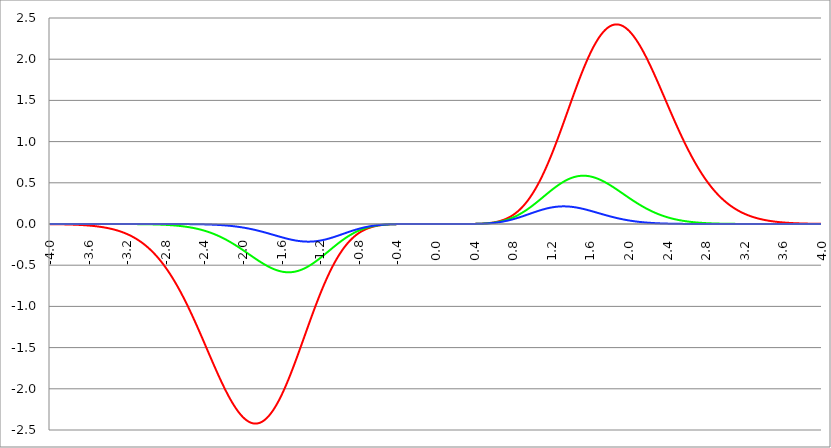
| Category | Series 1 | Series 0 | Series 2 |
|---|---|---|---|
| -4.0 | -0.002 | 0 | 0 |
| -3.996 | -0.002 | 0 | 0 |
| -3.992 | -0.002 | 0 | 0 |
| -3.988 | -0.002 | 0 | 0 |
| -3.984 | -0.002 | 0 | 0 |
| -3.98 | -0.002 | 0 | 0 |
| -3.976 | -0.002 | 0 | 0 |
| -3.972 | -0.002 | 0 | 0 |
| -3.968 | -0.002 | 0 | 0 |
| -3.964 | -0.002 | 0 | 0 |
| -3.96 | -0.002 | 0 | 0 |
| -3.956 | -0.002 | 0 | 0 |
| -3.952 | -0.002 | 0 | 0 |
| -3.948 | -0.003 | 0 | 0 |
| -3.944 | -0.003 | 0 | 0 |
| -3.94 | -0.003 | 0 | 0 |
| -3.936 | -0.003 | 0 | 0 |
| -3.932 | -0.003 | 0 | 0 |
| -3.928 | -0.003 | 0 | 0 |
| -3.924 | -0.003 | 0 | 0 |
| -3.92 | -0.003 | 0 | 0 |
| -3.916 | -0.003 | 0 | 0 |
| -3.912 | -0.003 | 0 | 0 |
| -3.908 | -0.003 | 0 | 0 |
| -3.904 | -0.003 | 0 | 0 |
| -3.9 | -0.003 | 0 | 0 |
| -3.896 | -0.003 | 0 | 0 |
| -3.892 | -0.004 | 0 | 0 |
| -3.888 | -0.004 | 0 | 0 |
| -3.884 | -0.004 | 0 | 0 |
| -3.88 | -0.004 | 0 | 0 |
| -3.876 | -0.004 | 0 | 0 |
| -3.872 | -0.004 | 0 | 0 |
| -3.868 | -0.004 | 0 | 0 |
| -3.864 | -0.004 | 0 | 0 |
| -3.86 | -0.004 | 0 | 0 |
| -3.856 | -0.004 | 0 | 0 |
| -3.852 | -0.005 | 0 | 0 |
| -3.848 | -0.005 | 0 | 0 |
| -3.844 | -0.005 | 0 | 0 |
| -3.84 | -0.005 | 0 | 0 |
| -3.836 | -0.005 | 0 | 0 |
| -3.832 | -0.005 | 0 | 0 |
| -3.828 | -0.005 | 0 | 0 |
| -3.824 | -0.005 | 0 | 0 |
| -3.82 | -0.005 | 0 | 0 |
| -3.816 | -0.006 | 0 | 0 |
| -3.812 | -0.006 | 0 | 0 |
| -3.808 | -0.006 | 0 | 0 |
| -3.804 | -0.006 | 0 | 0 |
| -3.8 | -0.006 | 0 | 0 |
| -3.796 | -0.006 | 0 | 0 |
| -3.792 | -0.006 | 0 | 0 |
| -3.788 | -0.007 | 0 | 0 |
| -3.784 | -0.007 | 0 | 0 |
| -3.78 | -0.007 | 0 | 0 |
| -3.776 | -0.007 | 0 | 0 |
| -3.772 | -0.007 | 0 | 0 |
| -3.768 | -0.007 | 0 | 0 |
| -3.764 | -0.008 | 0 | 0 |
| -3.76 | -0.008 | 0 | 0 |
| -3.756 | -0.008 | 0 | 0 |
| -3.752 | -0.008 | 0 | 0 |
| -3.748 | -0.008 | 0 | 0 |
| -3.744 | -0.008 | 0 | 0 |
| -3.74 | -0.009 | 0 | 0 |
| -3.736 | -0.009 | 0 | 0 |
| -3.732 | -0.009 | 0 | 0 |
| -3.728 | -0.009 | 0 | 0 |
| -3.724 | -0.009 | 0 | 0 |
| -3.72 | -0.01 | 0 | 0 |
| -3.716 | -0.01 | 0 | 0 |
| -3.712 | -0.01 | 0 | 0 |
| -3.708 | -0.01 | 0 | 0 |
| -3.704 | -0.011 | 0 | 0 |
| -3.7 | -0.011 | 0 | 0 |
| -3.696 | -0.011 | 0 | 0 |
| -3.692 | -0.011 | 0 | 0 |
| -3.688 | -0.011 | 0 | 0 |
| -3.684 | -0.012 | 0 | 0 |
| -3.68 | -0.012 | 0 | 0 |
| -3.676 | -0.012 | 0 | 0 |
| -3.672 | -0.013 | 0 | 0 |
| -3.668 | -0.013 | 0 | 0 |
| -3.664 | -0.013 | 0 | 0 |
| -3.66 | -0.013 | 0 | 0 |
| -3.656 | -0.014 | 0 | 0 |
| -3.652 | -0.014 | 0 | 0 |
| -3.648 | -0.014 | 0 | 0 |
| -3.644 | -0.015 | 0 | 0 |
| -3.64 | -0.015 | 0 | 0 |
| -3.636 | -0.015 | 0 | 0 |
| -3.632 | -0.016 | 0 | 0 |
| -3.628 | -0.016 | 0 | 0 |
| -3.624 | -0.016 | 0 | 0 |
| -3.62 | -0.017 | 0 | 0 |
| -3.616 | -0.017 | 0 | 0 |
| -3.612 | -0.017 | 0 | 0 |
| -3.608 | -0.018 | 0 | 0 |
| -3.604 | -0.018 | 0 | 0 |
| -3.6 | -0.018 | 0 | 0 |
| -3.596 | -0.019 | 0 | 0 |
| -3.592 | -0.019 | 0 | 0 |
| -3.588 | -0.02 | 0 | 0 |
| -3.584 | -0.02 | 0 | 0 |
| -3.58 | -0.02 | 0 | 0 |
| -3.576 | -0.021 | 0 | 0 |
| -3.572 | -0.021 | 0 | 0 |
| -3.568 | -0.022 | 0 | 0 |
| -3.564 | -0.022 | 0 | 0 |
| -3.56 | -0.023 | 0 | 0 |
| -3.556 | -0.023 | 0 | 0 |
| -3.552 | -0.024 | 0 | 0 |
| -3.548 | -0.024 | 0 | 0 |
| -3.544 | -0.025 | 0 | 0 |
| -3.54 | -0.025 | 0 | 0 |
| -3.536 | -0.026 | 0 | 0 |
| -3.532 | -0.026 | 0 | 0 |
| -3.528 | -0.027 | 0 | 0 |
| -3.524 | -0.027 | 0 | 0 |
| -3.52 | -0.028 | 0 | 0 |
| -3.516 | -0.028 | 0 | 0 |
| -3.512 | -0.029 | 0 | 0 |
| -3.508 | -0.03 | 0 | 0 |
| -3.504 | -0.03 | 0 | 0 |
| -3.5 | -0.031 | 0 | 0 |
| -3.496 | -0.031 | 0 | 0 |
| -3.492 | -0.032 | 0 | 0 |
| -3.488 | -0.033 | 0 | 0 |
| -3.484 | -0.033 | 0 | 0 |
| -3.48 | -0.034 | 0 | 0 |
| -3.476 | -0.035 | 0 | 0 |
| -3.472 | -0.035 | 0 | 0 |
| -3.467999999999999 | -0.036 | 0 | 0 |
| -3.463999999999999 | -0.037 | 0 | 0 |
| -3.459999999999999 | -0.038 | 0 | 0 |
| -3.455999999999999 | -0.038 | 0 | 0 |
| -3.451999999999999 | -0.039 | 0 | 0 |
| -3.447999999999999 | -0.04 | 0 | 0 |
| -3.443999999999999 | -0.041 | 0 | 0 |
| -3.439999999999999 | -0.041 | 0 | 0 |
| -3.435999999999999 | -0.042 | 0 | 0 |
| -3.431999999999999 | -0.043 | 0 | 0 |
| -3.427999999999999 | -0.044 | 0 | 0 |
| -3.423999999999999 | -0.045 | 0 | 0 |
| -3.419999999999999 | -0.046 | 0 | 0 |
| -3.415999999999999 | -0.046 | 0 | 0 |
| -3.411999999999999 | -0.047 | 0 | 0 |
| -3.407999999999999 | -0.048 | 0 | 0 |
| -3.403999999999999 | -0.049 | 0 | 0 |
| -3.399999999999999 | -0.05 | 0 | 0 |
| -3.395999999999999 | -0.051 | 0 | 0 |
| -3.391999999999999 | -0.052 | 0 | 0 |
| -3.387999999999999 | -0.053 | 0 | 0 |
| -3.383999999999999 | -0.054 | 0 | 0 |
| -3.379999999999999 | -0.055 | 0 | 0 |
| -3.375999999999999 | -0.056 | 0 | 0 |
| -3.371999999999999 | -0.057 | 0 | 0 |
| -3.367999999999999 | -0.058 | 0 | 0 |
| -3.363999999999999 | -0.059 | 0 | 0 |
| -3.359999999999999 | -0.06 | 0 | 0 |
| -3.355999999999999 | -0.062 | 0 | 0 |
| -3.351999999999999 | -0.063 | 0 | 0 |
| -3.347999999999999 | -0.064 | 0 | 0 |
| -3.343999999999999 | -0.065 | 0 | 0 |
| -3.339999999999999 | -0.066 | 0 | 0 |
| -3.335999999999999 | -0.068 | 0 | 0 |
| -3.331999999999999 | -0.069 | 0 | 0 |
| -3.327999999999999 | -0.07 | 0 | 0 |
| -3.323999999999999 | -0.071 | 0 | 0 |
| -3.319999999999999 | -0.073 | 0 | 0 |
| -3.315999999999999 | -0.074 | 0 | 0 |
| -3.311999999999999 | -0.075 | 0 | 0 |
| -3.307999999999999 | -0.077 | 0 | 0 |
| -3.303999999999999 | -0.078 | 0 | 0 |
| -3.299999999999999 | -0.079 | 0 | 0 |
| -3.295999999999999 | -0.081 | 0 | 0 |
| -3.291999999999999 | -0.082 | 0 | 0 |
| -3.288 | -0.084 | 0 | 0 |
| -3.284 | -0.085 | 0 | 0 |
| -3.279999999999999 | -0.087 | 0 | 0 |
| -3.275999999999999 | -0.088 | 0 | 0 |
| -3.271999999999999 | -0.09 | 0 | 0 |
| -3.268 | -0.092 | 0 | 0 |
| -3.264 | -0.093 | 0 | 0 |
| -3.259999999999999 | -0.095 | 0 | 0 |
| -3.255999999999999 | -0.097 | 0 | 0 |
| -3.251999999999999 | -0.098 | 0 | 0 |
| -3.248 | -0.1 | -0.001 | 0 |
| -3.244 | -0.102 | -0.001 | 0 |
| -3.239999999999999 | -0.103 | -0.001 | 0 |
| -3.235999999999999 | -0.105 | -0.001 | 0 |
| -3.231999999999999 | -0.107 | -0.001 | 0 |
| -3.228 | -0.109 | -0.001 | 0 |
| -3.224 | -0.111 | -0.001 | 0 |
| -3.219999999999999 | -0.113 | -0.001 | 0 |
| -3.215999999999999 | -0.115 | -0.001 | 0 |
| -3.211999999999999 | -0.117 | -0.001 | 0 |
| -3.208 | -0.119 | -0.001 | 0 |
| -3.204 | -0.121 | -0.001 | 0 |
| -3.199999999999999 | -0.123 | -0.001 | 0 |
| -3.195999999999999 | -0.125 | -0.001 | 0 |
| -3.191999999999999 | -0.127 | -0.001 | 0 |
| -3.188 | -0.129 | -0.001 | 0 |
| -3.184 | -0.131 | -0.001 | 0 |
| -3.179999999999999 | -0.133 | -0.001 | 0 |
| -3.175999999999999 | -0.136 | -0.001 | 0 |
| -3.171999999999999 | -0.138 | -0.001 | 0 |
| -3.168 | -0.14 | -0.001 | 0 |
| -3.164 | -0.143 | -0.001 | 0 |
| -3.159999999999999 | -0.145 | -0.001 | 0 |
| -3.155999999999999 | -0.147 | -0.001 | 0 |
| -3.151999999999999 | -0.15 | -0.001 | 0 |
| -3.148 | -0.152 | -0.001 | 0 |
| -3.144 | -0.155 | -0.001 | 0 |
| -3.139999999999999 | -0.157 | -0.001 | 0 |
| -3.135999999999999 | -0.16 | -0.001 | 0 |
| -3.131999999999999 | -0.162 | -0.001 | 0 |
| -3.128 | -0.165 | -0.001 | 0 |
| -3.124 | -0.168 | -0.001 | 0 |
| -3.119999999999999 | -0.17 | -0.001 | 0 |
| -3.115999999999999 | -0.173 | -0.001 | 0 |
| -3.111999999999999 | -0.176 | -0.001 | 0 |
| -3.108 | -0.179 | -0.001 | 0 |
| -3.104 | -0.182 | -0.001 | 0 |
| -3.099999999999999 | -0.184 | -0.002 | 0 |
| -3.095999999999999 | -0.187 | -0.002 | 0 |
| -3.091999999999999 | -0.19 | -0.002 | 0 |
| -3.088 | -0.193 | -0.002 | 0 |
| -3.084 | -0.196 | -0.002 | 0 |
| -3.079999999999999 | -0.2 | -0.002 | 0 |
| -3.075999999999999 | -0.203 | -0.002 | 0 |
| -3.071999999999999 | -0.206 | -0.002 | 0 |
| -3.068 | -0.209 | -0.002 | 0 |
| -3.064 | -0.212 | -0.002 | 0 |
| -3.059999999999999 | -0.216 | -0.002 | 0 |
| -3.055999999999999 | -0.219 | -0.002 | 0 |
| -3.051999999999999 | -0.222 | -0.002 | 0 |
| -3.048 | -0.226 | -0.002 | 0 |
| -3.044 | -0.229 | -0.002 | 0 |
| -3.039999999999999 | -0.233 | -0.002 | 0 |
| -3.035999999999999 | -0.236 | -0.002 | 0 |
| -3.031999999999999 | -0.24 | -0.002 | 0 |
| -3.028 | -0.243 | -0.002 | 0 |
| -3.024 | -0.247 | -0.003 | 0 |
| -3.019999999999999 | -0.251 | -0.003 | 0 |
| -3.015999999999999 | -0.254 | -0.003 | 0 |
| -3.011999999999999 | -0.258 | -0.003 | 0 |
| -3.008 | -0.262 | -0.003 | 0 |
| -3.004 | -0.266 | -0.003 | 0 |
| -2.999999999999999 | -0.27 | -0.003 | 0 |
| -2.995999999999999 | -0.274 | -0.003 | 0 |
| -2.991999999999999 | -0.278 | -0.003 | 0 |
| -2.988 | -0.282 | -0.003 | 0 |
| -2.984 | -0.286 | -0.003 | 0 |
| -2.979999999999999 | -0.29 | -0.003 | 0 |
| -2.975999999999999 | -0.294 | -0.004 | 0 |
| -2.971999999999999 | -0.299 | -0.004 | 0 |
| -2.968 | -0.303 | -0.004 | 0 |
| -2.964 | -0.307 | -0.004 | 0 |
| -2.959999999999999 | -0.312 | -0.004 | 0 |
| -2.955999999999999 | -0.316 | -0.004 | 0 |
| -2.951999999999999 | -0.321 | -0.004 | 0 |
| -2.948 | -0.325 | -0.004 | 0 |
| -2.944 | -0.33 | -0.004 | 0 |
| -2.939999999999999 | -0.335 | -0.004 | 0 |
| -2.935999999999999 | -0.339 | -0.005 | 0 |
| -2.931999999999999 | -0.344 | -0.005 | 0 |
| -2.928 | -0.349 | -0.005 | 0 |
| -2.924 | -0.354 | -0.005 | 0 |
| -2.919999999999999 | -0.359 | -0.005 | 0 |
| -2.915999999999999 | -0.364 | -0.005 | 0 |
| -2.911999999999999 | -0.369 | -0.005 | 0 |
| -2.908 | -0.374 | -0.005 | 0 |
| -2.904 | -0.379 | -0.006 | 0 |
| -2.899999999999999 | -0.384 | -0.006 | 0 |
| -2.895999999999999 | -0.389 | -0.006 | 0 |
| -2.891999999999999 | -0.395 | -0.006 | 0 |
| -2.887999999999999 | -0.4 | -0.006 | 0 |
| -2.883999999999999 | -0.405 | -0.006 | 0 |
| -2.879999999999999 | -0.411 | -0.006 | 0 |
| -2.875999999999999 | -0.416 | -0.007 | 0 |
| -2.871999999999999 | -0.422 | -0.007 | 0 |
| -2.867999999999999 | -0.427 | -0.007 | 0 |
| -2.863999999999999 | -0.433 | -0.007 | 0 |
| -2.859999999999999 | -0.439 | -0.007 | 0 |
| -2.855999999999999 | -0.445 | -0.008 | 0 |
| -2.851999999999999 | -0.45 | -0.008 | 0 |
| -2.847999999999999 | -0.456 | -0.008 | 0 |
| -2.843999999999999 | -0.462 | -0.008 | 0 |
| -2.839999999999999 | -0.468 | -0.008 | 0 |
| -2.835999999999999 | -0.474 | -0.009 | 0 |
| -2.831999999999999 | -0.48 | -0.009 | 0 |
| -2.827999999999999 | -0.486 | -0.009 | 0 |
| -2.823999999999999 | -0.493 | -0.009 | 0 |
| -2.819999999999999 | -0.499 | -0.009 | 0 |
| -2.815999999999999 | -0.505 | -0.01 | 0 |
| -2.811999999999999 | -0.512 | -0.01 | 0 |
| -2.807999999999999 | -0.518 | -0.01 | 0 |
| -2.803999999999999 | -0.525 | -0.01 | 0 |
| -2.799999999999999 | -0.531 | -0.011 | 0 |
| -2.795999999999999 | -0.538 | -0.011 | 0 |
| -2.791999999999999 | -0.544 | -0.011 | 0 |
| -2.787999999999999 | -0.551 | -0.011 | 0 |
| -2.783999999999999 | -0.558 | -0.012 | 0 |
| -2.779999999999999 | -0.565 | -0.012 | 0 |
| -2.775999999999999 | -0.572 | -0.012 | 0 |
| -2.771999999999999 | -0.579 | -0.012 | 0 |
| -2.767999999999999 | -0.586 | -0.013 | 0 |
| -2.763999999999999 | -0.593 | -0.013 | 0 |
| -2.759999999999999 | -0.6 | -0.013 | 0 |
| -2.755999999999999 | -0.607 | -0.014 | 0 |
| -2.751999999999999 | -0.614 | -0.014 | 0 |
| -2.747999999999999 | -0.622 | -0.014 | 0 |
| -2.743999999999999 | -0.629 | -0.015 | 0 |
| -2.739999999999999 | -0.636 | -0.015 | 0 |
| -2.735999999999999 | -0.644 | -0.015 | 0 |
| -2.731999999999999 | -0.651 | -0.016 | 0 |
| -2.727999999999999 | -0.659 | -0.016 | 0 |
| -2.723999999999999 | -0.667 | -0.016 | 0 |
| -2.719999999999999 | -0.674 | -0.017 | 0 |
| -2.715999999999999 | -0.682 | -0.017 | 0 |
| -2.711999999999999 | -0.69 | -0.017 | 0 |
| -2.707999999999999 | -0.698 | -0.018 | 0 |
| -2.703999999999999 | -0.706 | -0.018 | 0 |
| -2.699999999999999 | -0.714 | -0.019 | 0 |
| -2.695999999999999 | -0.722 | -0.019 | -0.001 |
| -2.691999999999999 | -0.73 | -0.019 | -0.001 |
| -2.687999999999999 | -0.738 | -0.02 | -0.001 |
| -2.683999999999999 | -0.746 | -0.02 | -0.001 |
| -2.679999999999999 | -0.755 | -0.021 | -0.001 |
| -2.675999999999999 | -0.763 | -0.021 | -0.001 |
| -2.671999999999999 | -0.771 | -0.022 | -0.001 |
| -2.667999999999999 | -0.78 | -0.022 | -0.001 |
| -2.663999999999999 | -0.788 | -0.023 | -0.001 |
| -2.659999999999999 | -0.797 | -0.023 | -0.001 |
| -2.655999999999999 | -0.805 | -0.024 | -0.001 |
| -2.651999999999999 | -0.814 | -0.024 | -0.001 |
| -2.647999999999999 | -0.823 | -0.025 | -0.001 |
| -2.643999999999999 | -0.831 | -0.025 | -0.001 |
| -2.639999999999999 | -0.84 | -0.026 | -0.001 |
| -2.635999999999999 | -0.849 | -0.026 | -0.001 |
| -2.631999999999999 | -0.858 | -0.027 | -0.001 |
| -2.627999999999999 | -0.867 | -0.027 | -0.001 |
| -2.623999999999999 | -0.876 | -0.028 | -0.001 |
| -2.619999999999999 | -0.885 | -0.029 | -0.001 |
| -2.615999999999999 | -0.894 | -0.029 | -0.001 |
| -2.611999999999999 | -0.903 | -0.03 | -0.001 |
| -2.607999999999999 | -0.912 | -0.03 | -0.001 |
| -2.603999999999999 | -0.922 | -0.031 | -0.001 |
| -2.599999999999999 | -0.931 | -0.032 | -0.001 |
| -2.595999999999999 | -0.94 | -0.032 | -0.001 |
| -2.591999999999999 | -0.95 | -0.033 | -0.001 |
| -2.587999999999999 | -0.959 | -0.034 | -0.001 |
| -2.583999999999999 | -0.969 | -0.034 | -0.001 |
| -2.579999999999999 | -0.978 | -0.035 | -0.001 |
| -2.575999999999999 | -0.988 | -0.036 | -0.001 |
| -2.571999999999999 | -0.998 | -0.037 | -0.001 |
| -2.567999999999999 | -1.007 | -0.037 | -0.001 |
| -2.563999999999999 | -1.017 | -0.038 | -0.001 |
| -2.559999999999999 | -1.027 | -0.039 | -0.001 |
| -2.555999999999999 | -1.037 | -0.04 | -0.002 |
| -2.551999999999999 | -1.046 | -0.04 | -0.002 |
| -2.547999999999999 | -1.056 | -0.041 | -0.002 |
| -2.543999999999999 | -1.066 | -0.042 | -0.002 |
| -2.539999999999999 | -1.076 | -0.043 | -0.002 |
| -2.535999999999999 | -1.086 | -0.044 | -0.002 |
| -2.531999999999999 | -1.096 | -0.044 | -0.002 |
| -2.527999999999999 | -1.107 | -0.045 | -0.002 |
| -2.523999999999999 | -1.117 | -0.046 | -0.002 |
| -2.519999999999999 | -1.127 | -0.047 | -0.002 |
| -2.515999999999999 | -1.137 | -0.048 | -0.002 |
| -2.511999999999999 | -1.147 | -0.049 | -0.002 |
| -2.507999999999999 | -1.158 | -0.05 | -0.002 |
| -2.503999999999999 | -1.168 | -0.051 | -0.002 |
| -2.499999999999999 | -1.178 | -0.052 | -0.002 |
| -2.495999999999999 | -1.189 | -0.053 | -0.002 |
| -2.491999999999999 | -1.199 | -0.054 | -0.002 |
| -2.487999999999999 | -1.21 | -0.055 | -0.002 |
| -2.483999999999999 | -1.22 | -0.056 | -0.003 |
| -2.479999999999999 | -1.23 | -0.057 | -0.003 |
| -2.475999999999999 | -1.241 | -0.058 | -0.003 |
| -2.471999999999999 | -1.252 | -0.059 | -0.003 |
| -2.467999999999999 | -1.262 | -0.06 | -0.003 |
| -2.463999999999999 | -1.273 | -0.061 | -0.003 |
| -2.459999999999999 | -1.283 | -0.062 | -0.003 |
| -2.455999999999999 | -1.294 | -0.063 | -0.003 |
| -2.451999999999999 | -1.305 | -0.065 | -0.003 |
| -2.447999999999999 | -1.315 | -0.066 | -0.003 |
| -2.443999999999999 | -1.326 | -0.067 | -0.003 |
| -2.439999999999999 | -1.337 | -0.068 | -0.003 |
| -2.435999999999999 | -1.348 | -0.069 | -0.004 |
| -2.431999999999999 | -1.358 | -0.071 | -0.004 |
| -2.427999999999999 | -1.369 | -0.072 | -0.004 |
| -2.423999999999999 | -1.38 | -0.073 | -0.004 |
| -2.419999999999999 | -1.391 | -0.074 | -0.004 |
| -2.415999999999999 | -1.402 | -0.076 | -0.004 |
| -2.411999999999999 | -1.413 | -0.077 | -0.004 |
| -2.407999999999999 | -1.423 | -0.078 | -0.004 |
| -2.403999999999999 | -1.434 | -0.08 | -0.004 |
| -2.399999999999999 | -1.445 | -0.081 | -0.005 |
| -2.395999999999999 | -1.456 | -0.083 | -0.005 |
| -2.391999999999999 | -1.467 | -0.084 | -0.005 |
| -2.387999999999999 | -1.478 | -0.085 | -0.005 |
| -2.383999999999999 | -1.489 | -0.087 | -0.005 |
| -2.379999999999999 | -1.5 | -0.088 | -0.005 |
| -2.375999999999999 | -1.511 | -0.09 | -0.005 |
| -2.371999999999999 | -1.522 | -0.091 | -0.005 |
| -2.367999999999998 | -1.532 | -0.093 | -0.006 |
| -2.363999999999998 | -1.543 | -0.094 | -0.006 |
| -2.359999999999998 | -1.554 | -0.096 | -0.006 |
| -2.355999999999998 | -1.565 | -0.098 | -0.006 |
| -2.351999999999998 | -1.576 | -0.099 | -0.006 |
| -2.347999999999998 | -1.587 | -0.101 | -0.006 |
| -2.343999999999998 | -1.598 | -0.102 | -0.007 |
| -2.339999999999998 | -1.609 | -0.104 | -0.007 |
| -2.335999999999998 | -1.62 | -0.106 | -0.007 |
| -2.331999999999998 | -1.63 | -0.108 | -0.007 |
| -2.327999999999998 | -1.641 | -0.109 | -0.007 |
| -2.323999999999998 | -1.652 | -0.111 | -0.007 |
| -2.319999999999998 | -1.663 | -0.113 | -0.008 |
| -2.315999999999998 | -1.674 | -0.115 | -0.008 |
| -2.311999999999998 | -1.684 | -0.116 | -0.008 |
| -2.307999999999998 | -1.695 | -0.118 | -0.008 |
| -2.303999999999998 | -1.706 | -0.12 | -0.008 |
| -2.299999999999998 | -1.717 | -0.122 | -0.009 |
| -2.295999999999998 | -1.727 | -0.124 | -0.009 |
| -2.291999999999998 | -1.738 | -0.126 | -0.009 |
| -2.287999999999998 | -1.749 | -0.128 | -0.009 |
| -2.283999999999998 | -1.759 | -0.13 | -0.01 |
| -2.279999999999998 | -1.77 | -0.132 | -0.01 |
| -2.275999999999998 | -1.78 | -0.134 | -0.01 |
| -2.271999999999998 | -1.791 | -0.136 | -0.01 |
| -2.267999999999998 | -1.801 | -0.138 | -0.011 |
| -2.263999999999998 | -1.812 | -0.14 | -0.011 |
| -2.259999999999998 | -1.822 | -0.142 | -0.011 |
| -2.255999999999998 | -1.832 | -0.144 | -0.011 |
| -2.251999999999998 | -1.843 | -0.146 | -0.012 |
| -2.247999999999998 | -1.853 | -0.148 | -0.012 |
| -2.243999999999998 | -1.863 | -0.15 | -0.012 |
| -2.239999999999998 | -1.873 | -0.152 | -0.012 |
| -2.235999999999998 | -1.883 | -0.155 | -0.013 |
| -2.231999999999998 | -1.894 | -0.157 | -0.013 |
| -2.227999999999998 | -1.904 | -0.159 | -0.013 |
| -2.223999999999998 | -1.914 | -0.161 | -0.014 |
| -2.219999999999998 | -1.924 | -0.164 | -0.014 |
| -2.215999999999998 | -1.933 | -0.166 | -0.014 |
| -2.211999999999998 | -1.943 | -0.168 | -0.015 |
| -2.207999999999998 | -1.953 | -0.171 | -0.015 |
| -2.203999999999998 | -1.963 | -0.173 | -0.015 |
| -2.199999999999998 | -1.972 | -0.175 | -0.016 |
| -2.195999999999998 | -1.982 | -0.178 | -0.016 |
| -2.191999999999998 | -1.991 | -0.18 | -0.016 |
| -2.187999999999998 | -2.001 | -0.183 | -0.017 |
| -2.183999999999998 | -2.01 | -0.185 | -0.017 |
| -2.179999999999998 | -2.02 | -0.188 | -0.017 |
| -2.175999999999998 | -2.029 | -0.19 | -0.018 |
| -2.171999999999998 | -2.038 | -0.193 | -0.018 |
| -2.167999999999998 | -2.047 | -0.195 | -0.019 |
| -2.163999999999998 | -2.056 | -0.198 | -0.019 |
| -2.159999999999998 | -2.065 | -0.2 | -0.019 |
| -2.155999999999998 | -2.074 | -0.203 | -0.02 |
| -2.151999999999998 | -2.083 | -0.206 | -0.02 |
| -2.147999999999998 | -2.091 | -0.208 | -0.021 |
| -2.143999999999998 | -2.1 | -0.211 | -0.021 |
| -2.139999999999998 | -2.109 | -0.214 | -0.022 |
| -2.135999999999998 | -2.117 | -0.216 | -0.022 |
| -2.131999999999998 | -2.125 | -0.219 | -0.023 |
| -2.127999999999998 | -2.134 | -0.222 | -0.023 |
| -2.123999999999998 | -2.142 | -0.224 | -0.024 |
| -2.119999999999998 | -2.15 | -0.227 | -0.024 |
| -2.115999999999998 | -2.158 | -0.23 | -0.025 |
| -2.111999999999998 | -2.166 | -0.233 | -0.025 |
| -2.107999999999998 | -2.174 | -0.236 | -0.026 |
| -2.103999999999998 | -2.182 | -0.239 | -0.026 |
| -2.099999999999998 | -2.189 | -0.241 | -0.027 |
| -2.095999999999998 | -2.197 | -0.244 | -0.027 |
| -2.091999999999998 | -2.204 | -0.247 | -0.028 |
| -2.087999999999998 | -2.212 | -0.25 | -0.028 |
| -2.083999999999998 | -2.219 | -0.253 | -0.029 |
| -2.079999999999998 | -2.226 | -0.256 | -0.029 |
| -2.075999999999998 | -2.233 | -0.259 | -0.03 |
| -2.071999999999998 | -2.24 | -0.262 | -0.031 |
| -2.067999999999998 | -2.247 | -0.265 | -0.031 |
| -2.063999999999998 | -2.253 | -0.268 | -0.032 |
| -2.059999999999998 | -2.26 | -0.271 | -0.032 |
| -2.055999999999998 | -2.266 | -0.274 | -0.033 |
| -2.051999999999998 | -2.273 | -0.277 | -0.034 |
| -2.047999999999998 | -2.279 | -0.28 | -0.034 |
| -2.043999999999998 | -2.285 | -0.283 | -0.035 |
| -2.039999999999998 | -2.291 | -0.286 | -0.036 |
| -2.035999999999998 | -2.297 | -0.289 | -0.036 |
| -2.031999999999998 | -2.303 | -0.292 | -0.037 |
| -2.027999999999998 | -2.308 | -0.295 | -0.038 |
| -2.023999999999998 | -2.314 | -0.298 | -0.038 |
| -2.019999999999998 | -2.319 | -0.302 | -0.039 |
| -2.015999999999998 | -2.325 | -0.305 | -0.04 |
| -2.011999999999998 | -2.33 | -0.308 | -0.041 |
| -2.007999999999998 | -2.335 | -0.311 | -0.041 |
| -2.003999999999998 | -2.34 | -0.314 | -0.042 |
| -1.999999999999998 | -2.344 | -0.317 | -0.043 |
| -1.995999999999998 | -2.349 | -0.32 | -0.044 |
| -1.991999999999998 | -2.354 | -0.324 | -0.045 |
| -1.987999999999998 | -2.358 | -0.327 | -0.045 |
| -1.983999999999998 | -2.362 | -0.33 | -0.046 |
| -1.979999999999998 | -2.366 | -0.333 | -0.047 |
| -1.975999999999998 | -2.37 | -0.336 | -0.048 |
| -1.971999999999998 | -2.374 | -0.34 | -0.049 |
| -1.967999999999998 | -2.378 | -0.343 | -0.049 |
| -1.963999999999998 | -2.381 | -0.346 | -0.05 |
| -1.959999999999998 | -2.385 | -0.349 | -0.051 |
| -1.955999999999998 | -2.388 | -0.353 | -0.052 |
| -1.951999999999998 | -2.391 | -0.356 | -0.053 |
| -1.947999999999998 | -2.394 | -0.359 | -0.054 |
| -1.943999999999998 | -2.397 | -0.362 | -0.055 |
| -1.939999999999998 | -2.399 | -0.365 | -0.056 |
| -1.935999999999998 | -2.402 | -0.369 | -0.057 |
| -1.931999999999998 | -2.404 | -0.372 | -0.058 |
| -1.927999999999998 | -2.407 | -0.375 | -0.058 |
| -1.923999999999998 | -2.409 | -0.378 | -0.059 |
| -1.919999999999998 | -2.411 | -0.382 | -0.06 |
| -1.915999999999998 | -2.412 | -0.385 | -0.061 |
| -1.911999999999998 | -2.414 | -0.388 | -0.062 |
| -1.907999999999998 | -2.416 | -0.391 | -0.063 |
| -1.903999999999998 | -2.417 | -0.395 | -0.064 |
| -1.899999999999998 | -2.418 | -0.398 | -0.065 |
| -1.895999999999998 | -2.419 | -0.401 | -0.066 |
| -1.891999999999998 | -2.42 | -0.404 | -0.067 |
| -1.887999999999998 | -2.421 | -0.407 | -0.069 |
| -1.883999999999998 | -2.421 | -0.41 | -0.07 |
| -1.879999999999998 | -2.422 | -0.414 | -0.071 |
| -1.875999999999998 | -2.422 | -0.417 | -0.072 |
| -1.871999999999998 | -2.422 | -0.42 | -0.073 |
| -1.867999999999998 | -2.422 | -0.423 | -0.074 |
| -1.863999999999998 | -2.422 | -0.426 | -0.075 |
| -1.859999999999998 | -2.422 | -0.429 | -0.076 |
| -1.855999999999998 | -2.421 | -0.433 | -0.077 |
| -1.851999999999998 | -2.42 | -0.436 | -0.078 |
| -1.847999999999998 | -2.42 | -0.439 | -0.08 |
| -1.843999999999998 | -2.419 | -0.442 | -0.081 |
| -1.839999999999998 | -2.418 | -0.445 | -0.082 |
| -1.835999999999998 | -2.416 | -0.448 | -0.083 |
| -1.831999999999998 | -2.415 | -0.451 | -0.084 |
| -1.827999999999998 | -2.413 | -0.454 | -0.085 |
| -1.823999999999998 | -2.411 | -0.457 | -0.087 |
| -1.819999999999998 | -2.41 | -0.46 | -0.088 |
| -1.815999999999998 | -2.408 | -0.463 | -0.089 |
| -1.811999999999998 | -2.405 | -0.466 | -0.09 |
| -1.807999999999998 | -2.403 | -0.469 | -0.091 |
| -1.803999999999998 | -2.4 | -0.472 | -0.093 |
| -1.799999999999998 | -2.398 | -0.475 | -0.094 |
| -1.795999999999998 | -2.395 | -0.477 | -0.095 |
| -1.791999999999998 | -2.392 | -0.48 | -0.096 |
| -1.787999999999998 | -2.389 | -0.483 | -0.098 |
| -1.783999999999998 | -2.385 | -0.486 | -0.099 |
| -1.779999999999998 | -2.382 | -0.489 | -0.1 |
| -1.775999999999998 | -2.378 | -0.491 | -0.101 |
| -1.771999999999998 | -2.374 | -0.494 | -0.103 |
| -1.767999999999998 | -2.371 | -0.497 | -0.104 |
| -1.763999999999998 | -2.366 | -0.499 | -0.105 |
| -1.759999999999998 | -2.362 | -0.502 | -0.107 |
| -1.755999999999998 | -2.358 | -0.505 | -0.108 |
| -1.751999999999998 | -2.353 | -0.507 | -0.109 |
| -1.747999999999998 | -2.349 | -0.51 | -0.111 |
| -1.743999999999998 | -2.344 | -0.512 | -0.112 |
| -1.739999999999998 | -2.339 | -0.515 | -0.113 |
| -1.735999999999998 | -2.334 | -0.517 | -0.115 |
| -1.731999999999998 | -2.328 | -0.52 | -0.116 |
| -1.727999999999998 | -2.323 | -0.522 | -0.117 |
| -1.723999999999998 | -2.317 | -0.524 | -0.119 |
| -1.719999999999998 | -2.311 | -0.527 | -0.12 |
| -1.715999999999998 | -2.306 | -0.529 | -0.121 |
| -1.711999999999998 | -2.3 | -0.531 | -0.123 |
| -1.707999999999998 | -2.293 | -0.533 | -0.124 |
| -1.703999999999998 | -2.287 | -0.535 | -0.125 |
| -1.699999999999998 | -2.281 | -0.538 | -0.127 |
| -1.695999999999998 | -2.274 | -0.54 | -0.128 |
| -1.691999999999998 | -2.267 | -0.542 | -0.129 |
| -1.687999999999998 | -2.26 | -0.544 | -0.131 |
| -1.683999999999998 | -2.253 | -0.546 | -0.132 |
| -1.679999999999998 | -2.246 | -0.548 | -0.134 |
| -1.675999999999998 | -2.239 | -0.55 | -0.135 |
| -1.671999999999998 | -2.231 | -0.551 | -0.136 |
| -1.667999999999998 | -2.224 | -0.553 | -0.138 |
| -1.663999999999998 | -2.216 | -0.555 | -0.139 |
| -1.659999999999998 | -2.208 | -0.557 | -0.14 |
| -1.655999999999998 | -2.2 | -0.558 | -0.142 |
| -1.651999999999998 | -2.192 | -0.56 | -0.143 |
| -1.647999999999998 | -2.184 | -0.562 | -0.144 |
| -1.643999999999998 | -2.175 | -0.563 | -0.146 |
| -1.639999999999998 | -2.167 | -0.565 | -0.147 |
| -1.635999999999998 | -2.158 | -0.566 | -0.148 |
| -1.631999999999998 | -2.149 | -0.568 | -0.15 |
| -1.627999999999998 | -2.141 | -0.569 | -0.151 |
| -1.623999999999998 | -2.132 | -0.57 | -0.153 |
| -1.619999999999998 | -2.122 | -0.571 | -0.154 |
| -1.615999999999998 | -2.113 | -0.573 | -0.155 |
| -1.611999999999998 | -2.104 | -0.574 | -0.156 |
| -1.607999999999998 | -2.094 | -0.575 | -0.158 |
| -1.603999999999998 | -2.085 | -0.576 | -0.159 |
| -1.599999999999998 | -2.075 | -0.577 | -0.16 |
| -1.595999999999998 | -2.065 | -0.578 | -0.162 |
| -1.591999999999998 | -2.055 | -0.579 | -0.163 |
| -1.587999999999998 | -2.045 | -0.58 | -0.164 |
| -1.583999999999998 | -2.035 | -0.58 | -0.166 |
| -1.579999999999998 | -2.025 | -0.581 | -0.167 |
| -1.575999999999998 | -2.015 | -0.582 | -0.168 |
| -1.571999999999998 | -2.004 | -0.583 | -0.169 |
| -1.567999999999998 | -1.994 | -0.583 | -0.171 |
| -1.563999999999998 | -1.983 | -0.584 | -0.172 |
| -1.559999999999998 | -1.972 | -0.584 | -0.173 |
| -1.555999999999998 | -1.961 | -0.585 | -0.174 |
| -1.551999999999998 | -1.951 | -0.585 | -0.175 |
| -1.547999999999998 | -1.94 | -0.585 | -0.177 |
| -1.543999999999998 | -1.928 | -0.586 | -0.178 |
| -1.539999999999998 | -1.917 | -0.586 | -0.179 |
| -1.535999999999998 | -1.906 | -0.586 | -0.18 |
| -1.531999999999998 | -1.895 | -0.586 | -0.181 |
| -1.527999999999998 | -1.883 | -0.586 | -0.182 |
| -1.523999999999998 | -1.872 | -0.586 | -0.183 |
| -1.519999999999998 | -1.86 | -0.586 | -0.185 |
| -1.515999999999998 | -1.848 | -0.586 | -0.186 |
| -1.511999999999998 | -1.837 | -0.586 | -0.187 |
| -1.507999999999998 | -1.825 | -0.585 | -0.188 |
| -1.503999999999998 | -1.813 | -0.585 | -0.189 |
| -1.499999999999998 | -1.801 | -0.585 | -0.19 |
| -1.495999999999998 | -1.789 | -0.584 | -0.191 |
| -1.491999999999998 | -1.777 | -0.584 | -0.192 |
| -1.487999999999998 | -1.765 | -0.583 | -0.193 |
| -1.483999999999998 | -1.752 | -0.583 | -0.194 |
| -1.479999999999998 | -1.74 | -0.582 | -0.195 |
| -1.475999999999998 | -1.728 | -0.581 | -0.196 |
| -1.471999999999998 | -1.715 | -0.581 | -0.196 |
| -1.467999999999998 | -1.703 | -0.58 | -0.197 |
| -1.463999999999998 | -1.69 | -0.579 | -0.198 |
| -1.459999999999998 | -1.678 | -0.578 | -0.199 |
| -1.455999999999998 | -1.665 | -0.577 | -0.2 |
| -1.451999999999998 | -1.653 | -0.576 | -0.201 |
| -1.447999999999998 | -1.64 | -0.575 | -0.201 |
| -1.443999999999998 | -1.627 | -0.574 | -0.202 |
| -1.439999999999998 | -1.614 | -0.572 | -0.203 |
| -1.435999999999998 | -1.601 | -0.571 | -0.204 |
| -1.431999999999998 | -1.589 | -0.57 | -0.204 |
| -1.427999999999998 | -1.576 | -0.568 | -0.205 |
| -1.423999999999998 | -1.563 | -0.567 | -0.206 |
| -1.419999999999998 | -1.55 | -0.566 | -0.206 |
| -1.415999999999998 | -1.537 | -0.564 | -0.207 |
| -1.411999999999998 | -1.524 | -0.562 | -0.208 |
| -1.407999999999998 | -1.511 | -0.561 | -0.208 |
| -1.403999999999998 | -1.498 | -0.559 | -0.209 |
| -1.399999999999998 | -1.485 | -0.557 | -0.209 |
| -1.395999999999998 | -1.472 | -0.555 | -0.21 |
| -1.391999999999998 | -1.459 | -0.554 | -0.21 |
| -1.387999999999998 | -1.446 | -0.552 | -0.211 |
| -1.383999999999998 | -1.432 | -0.55 | -0.211 |
| -1.379999999999998 | -1.419 | -0.548 | -0.211 |
| -1.375999999999998 | -1.406 | -0.546 | -0.212 |
| -1.371999999999998 | -1.393 | -0.544 | -0.212 |
| -1.367999999999998 | -1.38 | -0.541 | -0.212 |
| -1.363999999999998 | -1.367 | -0.539 | -0.213 |
| -1.359999999999998 | -1.354 | -0.537 | -0.213 |
| -1.355999999999998 | -1.34 | -0.535 | -0.213 |
| -1.351999999999998 | -1.327 | -0.532 | -0.213 |
| -1.347999999999998 | -1.314 | -0.53 | -0.214 |
| -1.343999999999998 | -1.301 | -0.527 | -0.214 |
| -1.339999999999998 | -1.288 | -0.525 | -0.214 |
| -1.335999999999998 | -1.275 | -0.522 | -0.214 |
| -1.331999999999998 | -1.262 | -0.52 | -0.214 |
| -1.327999999999998 | -1.249 | -0.517 | -0.214 |
| -1.323999999999998 | -1.236 | -0.514 | -0.214 |
| -1.319999999999998 | -1.223 | -0.512 | -0.214 |
| -1.315999999999998 | -1.21 | -0.509 | -0.214 |
| -1.311999999999998 | -1.197 | -0.506 | -0.214 |
| -1.307999999999998 | -1.184 | -0.503 | -0.214 |
| -1.303999999999998 | -1.171 | -0.5 | -0.214 |
| -1.299999999999998 | -1.158 | -0.497 | -0.214 |
| -1.295999999999998 | -1.145 | -0.494 | -0.213 |
| -1.291999999999998 | -1.132 | -0.491 | -0.213 |
| -1.287999999999998 | -1.119 | -0.488 | -0.213 |
| -1.283999999999998 | -1.107 | -0.485 | -0.213 |
| -1.279999999999998 | -1.094 | -0.482 | -0.213 |
| -1.275999999999998 | -1.081 | -0.479 | -0.212 |
| -1.271999999999998 | -1.068 | -0.476 | -0.212 |
| -1.267999999999998 | -1.056 | -0.473 | -0.211 |
| -1.263999999999998 | -1.043 | -0.469 | -0.211 |
| -1.259999999999998 | -1.031 | -0.466 | -0.211 |
| -1.255999999999998 | -1.018 | -0.463 | -0.21 |
| -1.251999999999998 | -1.006 | -0.459 | -0.21 |
| -1.247999999999998 | -0.993 | -0.456 | -0.209 |
| -1.243999999999998 | -0.981 | -0.452 | -0.209 |
| -1.239999999999998 | -0.969 | -0.449 | -0.208 |
| -1.235999999999998 | -0.956 | -0.446 | -0.208 |
| -1.231999999999998 | -0.944 | -0.442 | -0.207 |
| -1.227999999999998 | -0.932 | -0.439 | -0.206 |
| -1.223999999999998 | -0.92 | -0.435 | -0.206 |
| -1.219999999999998 | -0.908 | -0.431 | -0.205 |
| -1.215999999999998 | -0.896 | -0.428 | -0.204 |
| -1.211999999999998 | -0.884 | -0.424 | -0.204 |
| -1.207999999999998 | -0.872 | -0.421 | -0.203 |
| -1.203999999999998 | -0.861 | -0.417 | -0.202 |
| -1.199999999999997 | -0.849 | -0.413 | -0.201 |
| -1.195999999999997 | -0.837 | -0.41 | -0.2 |
| -1.191999999999997 | -0.826 | -0.406 | -0.199 |
| -1.187999999999997 | -0.814 | -0.402 | -0.199 |
| -1.183999999999997 | -0.803 | -0.398 | -0.198 |
| -1.179999999999997 | -0.792 | -0.395 | -0.197 |
| -1.175999999999997 | -0.78 | -0.391 | -0.196 |
| -1.171999999999997 | -0.769 | -0.387 | -0.195 |
| -1.167999999999997 | -0.758 | -0.383 | -0.194 |
| -1.163999999999997 | -0.747 | -0.379 | -0.193 |
| -1.159999999999997 | -0.736 | -0.376 | -0.192 |
| -1.155999999999997 | -0.725 | -0.372 | -0.191 |
| -1.151999999999997 | -0.714 | -0.368 | -0.189 |
| -1.147999999999997 | -0.703 | -0.364 | -0.188 |
| -1.143999999999997 | -0.693 | -0.36 | -0.187 |
| -1.139999999999997 | -0.682 | -0.356 | -0.186 |
| -1.135999999999997 | -0.672 | -0.352 | -0.185 |
| -1.131999999999997 | -0.661 | -0.348 | -0.184 |
| -1.127999999999997 | -0.651 | -0.345 | -0.182 |
| -1.123999999999997 | -0.641 | -0.341 | -0.181 |
| -1.119999999999997 | -0.631 | -0.337 | -0.18 |
| -1.115999999999997 | -0.621 | -0.333 | -0.179 |
| -1.111999999999997 | -0.611 | -0.329 | -0.177 |
| -1.107999999999997 | -0.601 | -0.325 | -0.176 |
| -1.103999999999997 | -0.591 | -0.321 | -0.175 |
| -1.099999999999997 | -0.581 | -0.317 | -0.173 |
| -1.095999999999997 | -0.571 | -0.313 | -0.172 |
| -1.091999999999997 | -0.562 | -0.31 | -0.171 |
| -1.087999999999997 | -0.552 | -0.306 | -0.169 |
| -1.083999999999997 | -0.543 | -0.302 | -0.168 |
| -1.079999999999997 | -0.534 | -0.298 | -0.166 |
| -1.075999999999997 | -0.525 | -0.294 | -0.165 |
| -1.071999999999997 | -0.516 | -0.29 | -0.163 |
| -1.067999999999997 | -0.507 | -0.286 | -0.162 |
| -1.063999999999997 | -0.498 | -0.283 | -0.16 |
| -1.059999999999997 | -0.489 | -0.279 | -0.159 |
| -1.055999999999997 | -0.48 | -0.275 | -0.157 |
| -1.051999999999997 | -0.471 | -0.271 | -0.156 |
| -1.047999999999997 | -0.463 | -0.267 | -0.154 |
| -1.043999999999997 | -0.455 | -0.264 | -0.153 |
| -1.039999999999997 | -0.446 | -0.26 | -0.151 |
| -1.035999999999997 | -0.438 | -0.256 | -0.15 |
| -1.031999999999997 | -0.43 | -0.252 | -0.148 |
| -1.027999999999997 | -0.422 | -0.249 | -0.147 |
| -1.023999999999997 | -0.414 | -0.245 | -0.145 |
| -1.019999999999997 | -0.406 | -0.241 | -0.143 |
| -1.015999999999997 | -0.398 | -0.238 | -0.142 |
| -1.011999999999997 | -0.39 | -0.234 | -0.14 |
| -1.007999999999997 | -0.383 | -0.23 | -0.139 |
| -1.003999999999997 | -0.375 | -0.227 | -0.137 |
| -0.999999999999997 | -0.368 | -0.223 | -0.135 |
| -0.995999999999997 | -0.361 | -0.22 | -0.134 |
| -0.991999999999997 | -0.353 | -0.216 | -0.132 |
| -0.987999999999997 | -0.346 | -0.213 | -0.13 |
| -0.983999999999997 | -0.339 | -0.209 | -0.129 |
| -0.979999999999997 | -0.332 | -0.206 | -0.127 |
| -0.975999999999997 | -0.325 | -0.202 | -0.126 |
| -0.971999999999997 | -0.319 | -0.199 | -0.124 |
| -0.967999999999997 | -0.312 | -0.195 | -0.122 |
| -0.963999999999997 | -0.305 | -0.192 | -0.121 |
| -0.959999999999997 | -0.299 | -0.189 | -0.119 |
| -0.955999999999997 | -0.293 | -0.185 | -0.117 |
| -0.951999999999997 | -0.286 | -0.182 | -0.116 |
| -0.947999999999997 | -0.28 | -0.179 | -0.114 |
| -0.943999999999997 | -0.274 | -0.176 | -0.112 |
| -0.939999999999997 | -0.268 | -0.172 | -0.111 |
| -0.935999999999997 | -0.262 | -0.169 | -0.109 |
| -0.931999999999997 | -0.256 | -0.166 | -0.108 |
| -0.927999999999997 | -0.251 | -0.163 | -0.106 |
| -0.923999999999997 | -0.245 | -0.16 | -0.104 |
| -0.919999999999997 | -0.239 | -0.157 | -0.103 |
| -0.915999999999997 | -0.234 | -0.154 | -0.101 |
| -0.911999999999997 | -0.228 | -0.151 | -0.099 |
| -0.907999999999997 | -0.223 | -0.148 | -0.098 |
| -0.903999999999997 | -0.218 | -0.145 | -0.096 |
| -0.899999999999997 | -0.213 | -0.142 | -0.095 |
| -0.895999999999997 | -0.208 | -0.139 | -0.093 |
| -0.891999999999997 | -0.203 | -0.136 | -0.092 |
| -0.887999999999997 | -0.198 | -0.133 | -0.09 |
| -0.883999999999997 | -0.193 | -0.131 | -0.088 |
| -0.879999999999997 | -0.188 | -0.128 | -0.087 |
| -0.875999999999997 | -0.184 | -0.125 | -0.085 |
| -0.871999999999997 | -0.179 | -0.123 | -0.084 |
| -0.867999999999997 | -0.175 | -0.12 | -0.082 |
| -0.863999999999997 | -0.17 | -0.117 | -0.081 |
| -0.859999999999997 | -0.166 | -0.115 | -0.079 |
| -0.855999999999997 | -0.162 | -0.112 | -0.078 |
| -0.851999999999997 | -0.158 | -0.11 | -0.076 |
| -0.847999999999997 | -0.154 | -0.107 | -0.075 |
| -0.843999999999997 | -0.15 | -0.105 | -0.073 |
| -0.839999999999997 | -0.146 | -0.102 | -0.072 |
| -0.835999999999997 | -0.142 | -0.1 | -0.071 |
| -0.831999999999997 | -0.138 | -0.098 | -0.069 |
| -0.827999999999997 | -0.134 | -0.095 | -0.068 |
| -0.823999999999997 | -0.131 | -0.093 | -0.066 |
| -0.819999999999997 | -0.127 | -0.091 | -0.065 |
| -0.815999999999997 | -0.124 | -0.089 | -0.064 |
| -0.811999999999997 | -0.12 | -0.087 | -0.062 |
| -0.807999999999997 | -0.117 | -0.084 | -0.061 |
| -0.803999999999997 | -0.114 | -0.082 | -0.06 |
| -0.799999999999997 | -0.111 | -0.08 | -0.058 |
| -0.795999999999997 | -0.107 | -0.078 | -0.057 |
| -0.791999999999997 | -0.104 | -0.076 | -0.056 |
| -0.787999999999997 | -0.101 | -0.074 | -0.054 |
| -0.783999999999997 | -0.098 | -0.072 | -0.053 |
| -0.779999999999997 | -0.096 | -0.071 | -0.052 |
| -0.775999999999997 | -0.093 | -0.069 | -0.051 |
| -0.771999999999997 | -0.09 | -0.067 | -0.05 |
| -0.767999999999997 | -0.087 | -0.065 | -0.048 |
| -0.763999999999997 | -0.085 | -0.063 | -0.047 |
| -0.759999999999997 | -0.082 | -0.062 | -0.046 |
| -0.755999999999997 | -0.08 | -0.06 | -0.045 |
| -0.751999999999997 | -0.077 | -0.058 | -0.044 |
| -0.747999999999997 | -0.075 | -0.057 | -0.043 |
| -0.743999999999997 | -0.073 | -0.055 | -0.042 |
| -0.739999999999997 | -0.07 | -0.053 | -0.041 |
| -0.735999999999997 | -0.068 | -0.052 | -0.04 |
| -0.731999999999997 | -0.066 | -0.05 | -0.039 |
| -0.727999999999997 | -0.064 | -0.049 | -0.038 |
| -0.723999999999997 | -0.062 | -0.048 | -0.037 |
| -0.719999999999997 | -0.06 | -0.046 | -0.036 |
| -0.715999999999997 | -0.058 | -0.045 | -0.035 |
| -0.711999999999997 | -0.056 | -0.043 | -0.034 |
| -0.707999999999997 | -0.054 | -0.042 | -0.033 |
| -0.703999999999997 | -0.052 | -0.041 | -0.032 |
| -0.699999999999997 | -0.05 | -0.039 | -0.031 |
| -0.695999999999997 | -0.049 | -0.038 | -0.03 |
| -0.691999999999997 | -0.047 | -0.037 | -0.029 |
| -0.687999999999997 | -0.045 | -0.036 | -0.028 |
| -0.683999999999997 | -0.044 | -0.035 | -0.027 |
| -0.679999999999997 | -0.042 | -0.034 | -0.027 |
| -0.675999999999997 | -0.041 | -0.033 | -0.026 |
| -0.671999999999997 | -0.039 | -0.031 | -0.025 |
| -0.667999999999997 | -0.038 | -0.03 | -0.024 |
| -0.663999999999997 | -0.037 | -0.029 | -0.024 |
| -0.659999999999997 | -0.035 | -0.028 | -0.023 |
| -0.655999999999997 | -0.034 | -0.027 | -0.022 |
| -0.651999999999997 | -0.033 | -0.026 | -0.021 |
| -0.647999999999997 | -0.032 | -0.026 | -0.021 |
| -0.643999999999997 | -0.03 | -0.025 | -0.02 |
| -0.639999999999997 | -0.029 | -0.024 | -0.019 |
| -0.635999999999997 | -0.028 | -0.023 | -0.019 |
| -0.631999999999997 | -0.027 | -0.022 | -0.018 |
| -0.627999999999997 | -0.026 | -0.021 | -0.018 |
| -0.623999999999997 | -0.025 | -0.021 | -0.017 |
| -0.619999999999997 | -0.024 | -0.02 | -0.016 |
| -0.615999999999997 | -0.023 | -0.019 | -0.016 |
| -0.611999999999997 | -0.022 | -0.018 | -0.015 |
| -0.607999999999997 | -0.021 | -0.018 | -0.015 |
| -0.603999999999997 | -0.02 | -0.017 | -0.014 |
| -0.599999999999997 | -0.02 | -0.016 | -0.014 |
| -0.595999999999997 | -0.019 | -0.016 | -0.013 |
| -0.591999999999997 | -0.018 | -0.015 | -0.013 |
| -0.587999999999997 | -0.017 | -0.014 | -0.012 |
| -0.583999999999997 | -0.016 | -0.014 | -0.012 |
| -0.579999999999997 | -0.016 | -0.013 | -0.011 |
| -0.575999999999997 | -0.015 | -0.013 | -0.011 |
| -0.571999999999997 | -0.014 | -0.012 | -0.01 |
| -0.567999999999997 | -0.014 | -0.012 | -0.01 |
| -0.563999999999997 | -0.013 | -0.011 | -0.01 |
| -0.559999999999997 | -0.013 | -0.011 | -0.009 |
| -0.555999999999997 | -0.012 | -0.01 | -0.009 |
| -0.551999999999997 | -0.012 | -0.01 | -0.008 |
| -0.547999999999997 | -0.011 | -0.009 | -0.008 |
| -0.543999999999997 | -0.01 | -0.009 | -0.008 |
| -0.539999999999997 | -0.01 | -0.009 | -0.007 |
| -0.535999999999997 | -0.01 | -0.008 | -0.007 |
| -0.531999999999997 | -0.009 | -0.008 | -0.007 |
| -0.527999999999997 | -0.009 | -0.008 | -0.007 |
| -0.523999999999997 | -0.008 | -0.007 | -0.006 |
| -0.519999999999997 | -0.008 | -0.007 | -0.006 |
| -0.515999999999997 | -0.007 | -0.007 | -0.006 |
| -0.511999999999997 | -0.007 | -0.006 | -0.005 |
| -0.507999999999997 | -0.007 | -0.006 | -0.005 |
| -0.503999999999997 | -0.006 | -0.006 | -0.005 |
| -0.499999999999997 | -0.006 | -0.005 | -0.005 |
| -0.495999999999997 | -0.006 | -0.005 | -0.005 |
| -0.491999999999997 | -0.005 | -0.005 | -0.004 |
| -0.487999999999997 | -0.005 | -0.005 | -0.004 |
| -0.483999999999997 | -0.005 | -0.004 | -0.004 |
| -0.479999999999997 | -0.005 | -0.004 | -0.004 |
| -0.475999999999997 | -0.004 | -0.004 | -0.004 |
| -0.471999999999997 | -0.004 | -0.004 | -0.003 |
| -0.467999999999997 | -0.004 | -0.004 | -0.003 |
| -0.463999999999997 | -0.004 | -0.003 | -0.003 |
| -0.459999999999997 | -0.004 | -0.003 | -0.003 |
| -0.455999999999997 | -0.003 | -0.003 | -0.003 |
| -0.451999999999997 | -0.003 | -0.003 | -0.003 |
| -0.447999999999997 | -0.003 | -0.003 | -0.002 |
| -0.443999999999997 | -0.003 | -0.003 | -0.002 |
| -0.439999999999997 | -0.003 | -0.002 | -0.002 |
| -0.435999999999997 | -0.002 | -0.002 | -0.002 |
| -0.431999999999997 | -0.002 | -0.002 | -0.002 |
| -0.427999999999997 | -0.002 | -0.002 | -0.002 |
| -0.423999999999997 | -0.002 | -0.002 | -0.002 |
| -0.419999999999997 | -0.002 | -0.002 | -0.002 |
| -0.415999999999997 | -0.002 | -0.002 | -0.002 |
| -0.411999999999997 | -0.002 | -0.002 | -0.001 |
| -0.407999999999997 | -0.002 | -0.001 | -0.001 |
| -0.403999999999997 | -0.001 | -0.001 | -0.001 |
| -0.399999999999997 | -0.001 | -0.001 | -0.001 |
| -0.395999999999997 | -0.001 | -0.001 | -0.001 |
| -0.391999999999997 | -0.001 | -0.001 | -0.001 |
| -0.387999999999997 | -0.001 | -0.001 | -0.001 |
| -0.383999999999997 | -0.001 | -0.001 | -0.001 |
| -0.379999999999997 | -0.001 | -0.001 | -0.001 |
| -0.375999999999997 | -0.001 | -0.001 | -0.001 |
| -0.371999999999997 | -0.001 | -0.001 | -0.001 |
| -0.367999999999997 | -0.001 | -0.001 | -0.001 |
| -0.363999999999997 | -0.001 | -0.001 | -0.001 |
| -0.359999999999997 | -0.001 | -0.001 | -0.001 |
| -0.355999999999997 | -0.001 | -0.001 | -0.001 |
| -0.351999999999997 | -0.001 | -0.001 | -0.001 |
| -0.347999999999997 | -0.001 | -0.001 | 0 |
| -0.343999999999997 | -0.001 | 0 | 0 |
| -0.339999999999997 | 0 | 0 | 0 |
| -0.335999999999997 | 0 | 0 | 0 |
| -0.331999999999997 | 0 | 0 | 0 |
| -0.327999999999997 | 0 | 0 | 0 |
| -0.323999999999997 | 0 | 0 | 0 |
| -0.319999999999997 | 0 | 0 | 0 |
| -0.315999999999997 | 0 | 0 | 0 |
| -0.311999999999997 | 0 | 0 | 0 |
| -0.307999999999997 | 0 | 0 | 0 |
| -0.303999999999997 | 0 | 0 | 0 |
| -0.299999999999997 | 0 | 0 | 0 |
| -0.295999999999997 | 0 | 0 | 0 |
| -0.291999999999997 | 0 | 0 | 0 |
| -0.287999999999997 | 0 | 0 | 0 |
| -0.283999999999997 | 0 | 0 | 0 |
| -0.279999999999997 | 0 | 0 | 0 |
| -0.275999999999997 | 0 | 0 | 0 |
| -0.271999999999997 | 0 | 0 | 0 |
| -0.267999999999997 | 0 | 0 | 0 |
| -0.263999999999997 | 0 | 0 | 0 |
| -0.259999999999997 | 0 | 0 | 0 |
| -0.255999999999997 | 0 | 0 | 0 |
| -0.251999999999997 | 0 | 0 | 0 |
| -0.247999999999997 | 0 | 0 | 0 |
| -0.243999999999997 | 0 | 0 | 0 |
| -0.239999999999997 | 0 | 0 | 0 |
| -0.235999999999997 | 0 | 0 | 0 |
| -0.231999999999997 | 0 | 0 | 0 |
| -0.227999999999997 | 0 | 0 | 0 |
| -0.223999999999997 | 0 | 0 | 0 |
| -0.219999999999997 | 0 | 0 | 0 |
| -0.215999999999997 | 0 | 0 | 0 |
| -0.211999999999997 | 0 | 0 | 0 |
| -0.207999999999997 | 0 | 0 | 0 |
| -0.203999999999997 | 0 | 0 | 0 |
| -0.199999999999997 | 0 | 0 | 0 |
| -0.195999999999997 | 0 | 0 | 0 |
| -0.191999999999997 | 0 | 0 | 0 |
| -0.187999999999997 | 0 | 0 | 0 |
| -0.183999999999997 | 0 | 0 | 0 |
| -0.179999999999997 | 0 | 0 | 0 |
| -0.175999999999997 | 0 | 0 | 0 |
| -0.171999999999997 | 0 | 0 | 0 |
| -0.167999999999997 | 0 | 0 | 0 |
| -0.163999999999997 | 0 | 0 | 0 |
| -0.159999999999997 | 0 | 0 | 0 |
| -0.155999999999997 | 0 | 0 | 0 |
| -0.151999999999997 | 0 | 0 | 0 |
| -0.147999999999997 | 0 | 0 | 0 |
| -0.143999999999997 | 0 | 0 | 0 |
| -0.139999999999997 | 0 | 0 | 0 |
| -0.135999999999997 | 0 | 0 | 0 |
| -0.131999999999997 | 0 | 0 | 0 |
| -0.127999999999997 | 0 | 0 | 0 |
| -0.123999999999997 | 0 | 0 | 0 |
| -0.119999999999997 | 0 | 0 | 0 |
| -0.115999999999997 | 0 | 0 | 0 |
| -0.111999999999997 | 0 | 0 | 0 |
| -0.107999999999997 | 0 | 0 | 0 |
| -0.103999999999997 | 0 | 0 | 0 |
| -0.0999999999999965 | 0 | 0 | 0 |
| -0.0959999999999965 | 0 | 0 | 0 |
| -0.0919999999999965 | 0 | 0 | 0 |
| -0.0879999999999965 | 0 | 0 | 0 |
| -0.0839999999999965 | 0 | 0 | 0 |
| -0.0799999999999965 | 0 | 0 | 0 |
| -0.0759999999999965 | 0 | 0 | 0 |
| -0.0719999999999965 | 0 | 0 | 0 |
| -0.0679999999999965 | 0 | 0 | 0 |
| -0.0639999999999965 | 0 | 0 | 0 |
| -0.0599999999999965 | 0 | 0 | 0 |
| -0.0559999999999965 | 0 | 0 | 0 |
| -0.0519999999999965 | 0 | 0 | 0 |
| -0.0479999999999965 | 0 | 0 | 0 |
| -0.0439999999999965 | 0 | 0 | 0 |
| -0.0399999999999965 | 0 | 0 | 0 |
| -0.0359999999999965 | 0 | 0 | 0 |
| -0.0319999999999965 | 0 | 0 | 0 |
| -0.0279999999999965 | 0 | 0 | 0 |
| -0.0239999999999965 | 0 | 0 | 0 |
| -0.0199999999999965 | 0 | 0 | 0 |
| -0.0159999999999965 | 0 | 0 | 0 |
| -0.0119999999999965 | 0 | 0 | 0 |
| -0.00799999999999647 | 0 | 0 | 0 |
| -0.00399999999999647 | 0 | 0 | 0 |
| 3.52495810318487e-15 | 0 | 0 | 0 |
| 0.00400000000000352 | 0 | 0 | 0 |
| 0.00800000000000352 | 0 | 0 | 0 |
| 0.0120000000000035 | 0 | 0 | 0 |
| 0.0160000000000035 | 0 | 0 | 0 |
| 0.0200000000000035 | 0 | 0 | 0 |
| 0.0240000000000035 | 0 | 0 | 0 |
| 0.0280000000000035 | 0 | 0 | 0 |
| 0.0320000000000035 | 0 | 0 | 0 |
| 0.0360000000000035 | 0 | 0 | 0 |
| 0.0400000000000035 | 0 | 0 | 0 |
| 0.0440000000000035 | 0 | 0 | 0 |
| 0.0480000000000035 | 0 | 0 | 0 |
| 0.0520000000000035 | 0 | 0 | 0 |
| 0.0560000000000035 | 0 | 0 | 0 |
| 0.0600000000000035 | 0 | 0 | 0 |
| 0.0640000000000035 | 0 | 0 | 0 |
| 0.0680000000000035 | 0 | 0 | 0 |
| 0.0720000000000036 | 0 | 0 | 0 |
| 0.0760000000000036 | 0 | 0 | 0 |
| 0.0800000000000036 | 0 | 0 | 0 |
| 0.0840000000000036 | 0 | 0 | 0 |
| 0.0880000000000036 | 0 | 0 | 0 |
| 0.0920000000000036 | 0 | 0 | 0 |
| 0.0960000000000036 | 0 | 0 | 0 |
| 0.100000000000004 | 0 | 0 | 0 |
| 0.104000000000004 | 0 | 0 | 0 |
| 0.108000000000004 | 0 | 0 | 0 |
| 0.112000000000004 | 0 | 0 | 0 |
| 0.116000000000004 | 0 | 0 | 0 |
| 0.120000000000004 | 0 | 0 | 0 |
| 0.124000000000004 | 0 | 0 | 0 |
| 0.128000000000004 | 0 | 0 | 0 |
| 0.132000000000004 | 0 | 0 | 0 |
| 0.136000000000004 | 0 | 0 | 0 |
| 0.140000000000004 | 0 | 0 | 0 |
| 0.144000000000004 | 0 | 0 | 0 |
| 0.148000000000004 | 0 | 0 | 0 |
| 0.152000000000004 | 0 | 0 | 0 |
| 0.156000000000004 | 0 | 0 | 0 |
| 0.160000000000004 | 0 | 0 | 0 |
| 0.164000000000004 | 0 | 0 | 0 |
| 0.168000000000004 | 0 | 0 | 0 |
| 0.172000000000004 | 0 | 0 | 0 |
| 0.176000000000004 | 0 | 0 | 0 |
| 0.180000000000004 | 0 | 0 | 0 |
| 0.184000000000004 | 0 | 0 | 0 |
| 0.188000000000004 | 0 | 0 | 0 |
| 0.192000000000004 | 0 | 0 | 0 |
| 0.196000000000004 | 0 | 0 | 0 |
| 0.200000000000004 | 0 | 0 | 0 |
| 0.204000000000004 | 0 | 0 | 0 |
| 0.208000000000004 | 0 | 0 | 0 |
| 0.212000000000004 | 0 | 0 | 0 |
| 0.216000000000004 | 0 | 0 | 0 |
| 0.220000000000004 | 0 | 0 | 0 |
| 0.224000000000004 | 0 | 0 | 0 |
| 0.228000000000004 | 0 | 0 | 0 |
| 0.232000000000004 | 0 | 0 | 0 |
| 0.236000000000004 | 0 | 0 | 0 |
| 0.240000000000004 | 0 | 0 | 0 |
| 0.244000000000004 | 0 | 0 | 0 |
| 0.248000000000004 | 0 | 0 | 0 |
| 0.252000000000004 | 0 | 0 | 0 |
| 0.256000000000004 | 0 | 0 | 0 |
| 0.260000000000004 | 0 | 0 | 0 |
| 0.264000000000004 | 0 | 0 | 0 |
| 0.268000000000004 | 0 | 0 | 0 |
| 0.272000000000004 | 0 | 0 | 0 |
| 0.276000000000004 | 0 | 0 | 0 |
| 0.280000000000004 | 0 | 0 | 0 |
| 0.284000000000004 | 0 | 0 | 0 |
| 0.288000000000004 | 0 | 0 | 0 |
| 0.292000000000004 | 0 | 0 | 0 |
| 0.296000000000004 | 0 | 0 | 0 |
| 0.300000000000004 | 0 | 0 | 0 |
| 0.304000000000004 | 0 | 0 | 0 |
| 0.308000000000004 | 0 | 0 | 0 |
| 0.312000000000004 | 0 | 0 | 0 |
| 0.316000000000004 | 0 | 0 | 0 |
| 0.320000000000004 | 0 | 0 | 0 |
| 0.324000000000004 | 0 | 0 | 0 |
| 0.328000000000004 | 0 | 0 | 0 |
| 0.332000000000004 | 0 | 0 | 0 |
| 0.336000000000004 | 0 | 0 | 0 |
| 0.340000000000004 | 0 | 0 | 0 |
| 0.344000000000004 | 0.001 | 0 | 0 |
| 0.348000000000004 | 0.001 | 0.001 | 0 |
| 0.352000000000004 | 0.001 | 0.001 | 0.001 |
| 0.356000000000004 | 0.001 | 0.001 | 0.001 |
| 0.360000000000004 | 0.001 | 0.001 | 0.001 |
| 0.364000000000004 | 0.001 | 0.001 | 0.001 |
| 0.368000000000004 | 0.001 | 0.001 | 0.001 |
| 0.372000000000004 | 0.001 | 0.001 | 0.001 |
| 0.376000000000004 | 0.001 | 0.001 | 0.001 |
| 0.380000000000004 | 0.001 | 0.001 | 0.001 |
| 0.384000000000004 | 0.001 | 0.001 | 0.001 |
| 0.388000000000004 | 0.001 | 0.001 | 0.001 |
| 0.392000000000004 | 0.001 | 0.001 | 0.001 |
| 0.396000000000004 | 0.001 | 0.001 | 0.001 |
| 0.400000000000004 | 0.001 | 0.001 | 0.001 |
| 0.404000000000004 | 0.001 | 0.001 | 0.001 |
| 0.408000000000004 | 0.002 | 0.001 | 0.001 |
| 0.412000000000004 | 0.002 | 0.002 | 0.001 |
| 0.416000000000004 | 0.002 | 0.002 | 0.002 |
| 0.420000000000004 | 0.002 | 0.002 | 0.002 |
| 0.424000000000004 | 0.002 | 0.002 | 0.002 |
| 0.428000000000004 | 0.002 | 0.002 | 0.002 |
| 0.432000000000004 | 0.002 | 0.002 | 0.002 |
| 0.436000000000004 | 0.002 | 0.002 | 0.002 |
| 0.440000000000004 | 0.003 | 0.002 | 0.002 |
| 0.444000000000004 | 0.003 | 0.003 | 0.002 |
| 0.448000000000004 | 0.003 | 0.003 | 0.002 |
| 0.452000000000004 | 0.003 | 0.003 | 0.003 |
| 0.456000000000004 | 0.003 | 0.003 | 0.003 |
| 0.460000000000004 | 0.004 | 0.003 | 0.003 |
| 0.464000000000004 | 0.004 | 0.003 | 0.003 |
| 0.468000000000004 | 0.004 | 0.004 | 0.003 |
| 0.472000000000004 | 0.004 | 0.004 | 0.003 |
| 0.476000000000004 | 0.004 | 0.004 | 0.004 |
| 0.480000000000004 | 0.005 | 0.004 | 0.004 |
| 0.484000000000004 | 0.005 | 0.004 | 0.004 |
| 0.488000000000004 | 0.005 | 0.005 | 0.004 |
| 0.492000000000004 | 0.005 | 0.005 | 0.004 |
| 0.496000000000004 | 0.006 | 0.005 | 0.005 |
| 0.500000000000004 | 0.006 | 0.005 | 0.005 |
| 0.504000000000004 | 0.006 | 0.006 | 0.005 |
| 0.508000000000004 | 0.007 | 0.006 | 0.005 |
| 0.512000000000004 | 0.007 | 0.006 | 0.005 |
| 0.516000000000004 | 0.007 | 0.007 | 0.006 |
| 0.520000000000004 | 0.008 | 0.007 | 0.006 |
| 0.524000000000004 | 0.008 | 0.007 | 0.006 |
| 0.528000000000004 | 0.009 | 0.008 | 0.007 |
| 0.532000000000004 | 0.009 | 0.008 | 0.007 |
| 0.536000000000004 | 0.01 | 0.008 | 0.007 |
| 0.540000000000004 | 0.01 | 0.009 | 0.007 |
| 0.544000000000004 | 0.01 | 0.009 | 0.008 |
| 0.548000000000004 | 0.011 | 0.009 | 0.008 |
| 0.552000000000004 | 0.012 | 0.01 | 0.008 |
| 0.556000000000004 | 0.012 | 0.01 | 0.009 |
| 0.560000000000004 | 0.013 | 0.011 | 0.009 |
| 0.564000000000004 | 0.013 | 0.011 | 0.01 |
| 0.568000000000004 | 0.014 | 0.012 | 0.01 |
| 0.572000000000004 | 0.014 | 0.012 | 0.01 |
| 0.576000000000004 | 0.015 | 0.013 | 0.011 |
| 0.580000000000004 | 0.016 | 0.013 | 0.011 |
| 0.584000000000004 | 0.016 | 0.014 | 0.012 |
| 0.588000000000004 | 0.017 | 0.014 | 0.012 |
| 0.592000000000004 | 0.018 | 0.015 | 0.013 |
| 0.596000000000004 | 0.019 | 0.016 | 0.013 |
| 0.600000000000004 | 0.02 | 0.016 | 0.014 |
| 0.604000000000004 | 0.02 | 0.017 | 0.014 |
| 0.608000000000004 | 0.021 | 0.018 | 0.015 |
| 0.612000000000004 | 0.022 | 0.018 | 0.015 |
| 0.616000000000004 | 0.023 | 0.019 | 0.016 |
| 0.620000000000004 | 0.024 | 0.02 | 0.016 |
| 0.624000000000004 | 0.025 | 0.021 | 0.017 |
| 0.628000000000004 | 0.026 | 0.021 | 0.018 |
| 0.632000000000004 | 0.027 | 0.022 | 0.018 |
| 0.636000000000004 | 0.028 | 0.023 | 0.019 |
| 0.640000000000004 | 0.029 | 0.024 | 0.019 |
| 0.644000000000004 | 0.03 | 0.025 | 0.02 |
| 0.648000000000004 | 0.032 | 0.026 | 0.021 |
| 0.652000000000004 | 0.033 | 0.026 | 0.021 |
| 0.656000000000004 | 0.034 | 0.027 | 0.022 |
| 0.660000000000004 | 0.035 | 0.028 | 0.023 |
| 0.664000000000004 | 0.037 | 0.029 | 0.024 |
| 0.668000000000004 | 0.038 | 0.03 | 0.024 |
| 0.672000000000004 | 0.039 | 0.031 | 0.025 |
| 0.676000000000004 | 0.041 | 0.033 | 0.026 |
| 0.680000000000004 | 0.042 | 0.034 | 0.027 |
| 0.684000000000004 | 0.044 | 0.035 | 0.027 |
| 0.688000000000004 | 0.045 | 0.036 | 0.028 |
| 0.692000000000004 | 0.047 | 0.037 | 0.029 |
| 0.696000000000004 | 0.049 | 0.038 | 0.03 |
| 0.700000000000004 | 0.05 | 0.039 | 0.031 |
| 0.704000000000004 | 0.052 | 0.041 | 0.032 |
| 0.708000000000004 | 0.054 | 0.042 | 0.033 |
| 0.712000000000004 | 0.056 | 0.043 | 0.034 |
| 0.716000000000004 | 0.058 | 0.045 | 0.035 |
| 0.720000000000004 | 0.06 | 0.046 | 0.036 |
| 0.724000000000004 | 0.062 | 0.048 | 0.037 |
| 0.728000000000004 | 0.064 | 0.049 | 0.038 |
| 0.732000000000004 | 0.066 | 0.05 | 0.039 |
| 0.736000000000004 | 0.068 | 0.052 | 0.04 |
| 0.740000000000004 | 0.07 | 0.053 | 0.041 |
| 0.744000000000004 | 0.073 | 0.055 | 0.042 |
| 0.748000000000004 | 0.075 | 0.057 | 0.043 |
| 0.752000000000004 | 0.077 | 0.058 | 0.044 |
| 0.756000000000004 | 0.08 | 0.06 | 0.045 |
| 0.760000000000004 | 0.082 | 0.062 | 0.046 |
| 0.764000000000004 | 0.085 | 0.063 | 0.047 |
| 0.768000000000004 | 0.087 | 0.065 | 0.048 |
| 0.772000000000004 | 0.09 | 0.067 | 0.05 |
| 0.776000000000004 | 0.093 | 0.069 | 0.051 |
| 0.780000000000004 | 0.096 | 0.071 | 0.052 |
| 0.784000000000004 | 0.098 | 0.072 | 0.053 |
| 0.788000000000004 | 0.101 | 0.074 | 0.054 |
| 0.792000000000004 | 0.104 | 0.076 | 0.056 |
| 0.796000000000004 | 0.107 | 0.078 | 0.057 |
| 0.800000000000004 | 0.111 | 0.08 | 0.058 |
| 0.804000000000004 | 0.114 | 0.082 | 0.06 |
| 0.808000000000004 | 0.117 | 0.084 | 0.061 |
| 0.812000000000004 | 0.12 | 0.087 | 0.062 |
| 0.816000000000004 | 0.124 | 0.089 | 0.064 |
| 0.820000000000004 | 0.127 | 0.091 | 0.065 |
| 0.824000000000004 | 0.131 | 0.093 | 0.066 |
| 0.828000000000004 | 0.134 | 0.095 | 0.068 |
| 0.832000000000004 | 0.138 | 0.098 | 0.069 |
| 0.836000000000004 | 0.142 | 0.1 | 0.071 |
| 0.840000000000004 | 0.146 | 0.102 | 0.072 |
| 0.844000000000004 | 0.15 | 0.105 | 0.073 |
| 0.848000000000004 | 0.154 | 0.107 | 0.075 |
| 0.852000000000004 | 0.158 | 0.11 | 0.076 |
| 0.856000000000004 | 0.162 | 0.112 | 0.078 |
| 0.860000000000004 | 0.166 | 0.115 | 0.079 |
| 0.864000000000004 | 0.17 | 0.117 | 0.081 |
| 0.868000000000004 | 0.175 | 0.12 | 0.082 |
| 0.872000000000004 | 0.179 | 0.123 | 0.084 |
| 0.876000000000004 | 0.184 | 0.125 | 0.085 |
| 0.880000000000004 | 0.188 | 0.128 | 0.087 |
| 0.884000000000004 | 0.193 | 0.131 | 0.088 |
| 0.888000000000004 | 0.198 | 0.133 | 0.09 |
| 0.892000000000004 | 0.203 | 0.136 | 0.092 |
| 0.896000000000004 | 0.208 | 0.139 | 0.093 |
| 0.900000000000004 | 0.213 | 0.142 | 0.095 |
| 0.904000000000004 | 0.218 | 0.145 | 0.096 |
| 0.908000000000004 | 0.223 | 0.148 | 0.098 |
| 0.912000000000004 | 0.228 | 0.151 | 0.099 |
| 0.916000000000004 | 0.234 | 0.154 | 0.101 |
| 0.920000000000004 | 0.239 | 0.157 | 0.103 |
| 0.924000000000004 | 0.245 | 0.16 | 0.104 |
| 0.928000000000004 | 0.251 | 0.163 | 0.106 |
| 0.932000000000004 | 0.256 | 0.166 | 0.108 |
| 0.936000000000004 | 0.262 | 0.169 | 0.109 |
| 0.940000000000004 | 0.268 | 0.172 | 0.111 |
| 0.944000000000004 | 0.274 | 0.176 | 0.112 |
| 0.948000000000004 | 0.28 | 0.179 | 0.114 |
| 0.952000000000004 | 0.286 | 0.182 | 0.116 |
| 0.956000000000004 | 0.293 | 0.185 | 0.117 |
| 0.960000000000004 | 0.299 | 0.189 | 0.119 |
| 0.964000000000004 | 0.305 | 0.192 | 0.121 |
| 0.968000000000004 | 0.312 | 0.195 | 0.122 |
| 0.972000000000004 | 0.319 | 0.199 | 0.124 |
| 0.976000000000004 | 0.325 | 0.202 | 0.126 |
| 0.980000000000004 | 0.332 | 0.206 | 0.127 |
| 0.984000000000004 | 0.339 | 0.209 | 0.129 |
| 0.988000000000004 | 0.346 | 0.213 | 0.13 |
| 0.992000000000004 | 0.353 | 0.216 | 0.132 |
| 0.996000000000004 | 0.361 | 0.22 | 0.134 |
| 1.000000000000004 | 0.368 | 0.223 | 0.135 |
| 1.004000000000004 | 0.375 | 0.227 | 0.137 |
| 1.008000000000004 | 0.383 | 0.23 | 0.139 |
| 1.012000000000004 | 0.39 | 0.234 | 0.14 |
| 1.016000000000004 | 0.398 | 0.238 | 0.142 |
| 1.020000000000004 | 0.406 | 0.241 | 0.143 |
| 1.024000000000004 | 0.414 | 0.245 | 0.145 |
| 1.028000000000004 | 0.422 | 0.249 | 0.147 |
| 1.032000000000004 | 0.43 | 0.252 | 0.148 |
| 1.036000000000004 | 0.438 | 0.256 | 0.15 |
| 1.040000000000004 | 0.446 | 0.26 | 0.151 |
| 1.044000000000004 | 0.455 | 0.264 | 0.153 |
| 1.048000000000004 | 0.463 | 0.267 | 0.154 |
| 1.052000000000004 | 0.471 | 0.271 | 0.156 |
| 1.056000000000004 | 0.48 | 0.275 | 0.157 |
| 1.060000000000004 | 0.489 | 0.279 | 0.159 |
| 1.064000000000004 | 0.498 | 0.283 | 0.16 |
| 1.068000000000004 | 0.507 | 0.286 | 0.162 |
| 1.072000000000004 | 0.516 | 0.29 | 0.163 |
| 1.076000000000004 | 0.525 | 0.294 | 0.165 |
| 1.080000000000004 | 0.534 | 0.298 | 0.166 |
| 1.084000000000004 | 0.543 | 0.302 | 0.168 |
| 1.088000000000004 | 0.552 | 0.306 | 0.169 |
| 1.092000000000004 | 0.562 | 0.31 | 0.171 |
| 1.096000000000004 | 0.571 | 0.313 | 0.172 |
| 1.100000000000004 | 0.581 | 0.317 | 0.173 |
| 1.104000000000004 | 0.591 | 0.321 | 0.175 |
| 1.108000000000004 | 0.601 | 0.325 | 0.176 |
| 1.112000000000004 | 0.611 | 0.329 | 0.177 |
| 1.116000000000004 | 0.621 | 0.333 | 0.179 |
| 1.120000000000004 | 0.631 | 0.337 | 0.18 |
| 1.124000000000004 | 0.641 | 0.341 | 0.181 |
| 1.128000000000004 | 0.651 | 0.345 | 0.182 |
| 1.132000000000004 | 0.661 | 0.348 | 0.184 |
| 1.136000000000004 | 0.672 | 0.352 | 0.185 |
| 1.140000000000004 | 0.682 | 0.356 | 0.186 |
| 1.144000000000004 | 0.693 | 0.36 | 0.187 |
| 1.148000000000004 | 0.703 | 0.364 | 0.188 |
| 1.152000000000004 | 0.714 | 0.368 | 0.189 |
| 1.156000000000004 | 0.725 | 0.372 | 0.191 |
| 1.160000000000004 | 0.736 | 0.376 | 0.192 |
| 1.164000000000004 | 0.747 | 0.379 | 0.193 |
| 1.168000000000004 | 0.758 | 0.383 | 0.194 |
| 1.172000000000004 | 0.769 | 0.387 | 0.195 |
| 1.176000000000004 | 0.78 | 0.391 | 0.196 |
| 1.180000000000004 | 0.792 | 0.395 | 0.197 |
| 1.184000000000004 | 0.803 | 0.398 | 0.198 |
| 1.188000000000004 | 0.814 | 0.402 | 0.199 |
| 1.192000000000004 | 0.826 | 0.406 | 0.199 |
| 1.196000000000004 | 0.837 | 0.41 | 0.2 |
| 1.200000000000004 | 0.849 | 0.413 | 0.201 |
| 1.204000000000004 | 0.861 | 0.417 | 0.202 |
| 1.208000000000004 | 0.872 | 0.421 | 0.203 |
| 1.212000000000004 | 0.884 | 0.424 | 0.204 |
| 1.216000000000004 | 0.896 | 0.428 | 0.204 |
| 1.220000000000004 | 0.908 | 0.431 | 0.205 |
| 1.224000000000004 | 0.92 | 0.435 | 0.206 |
| 1.228000000000004 | 0.932 | 0.439 | 0.206 |
| 1.232000000000004 | 0.944 | 0.442 | 0.207 |
| 1.236000000000004 | 0.956 | 0.446 | 0.208 |
| 1.240000000000004 | 0.969 | 0.449 | 0.208 |
| 1.244000000000004 | 0.981 | 0.452 | 0.209 |
| 1.248000000000004 | 0.993 | 0.456 | 0.209 |
| 1.252000000000004 | 1.006 | 0.459 | 0.21 |
| 1.256000000000004 | 1.018 | 0.463 | 0.21 |
| 1.260000000000004 | 1.031 | 0.466 | 0.211 |
| 1.264000000000004 | 1.043 | 0.469 | 0.211 |
| 1.268000000000004 | 1.056 | 0.473 | 0.211 |
| 1.272000000000004 | 1.068 | 0.476 | 0.212 |
| 1.276000000000004 | 1.081 | 0.479 | 0.212 |
| 1.280000000000004 | 1.094 | 0.482 | 0.213 |
| 1.284000000000004 | 1.107 | 0.485 | 0.213 |
| 1.288000000000004 | 1.119 | 0.488 | 0.213 |
| 1.292000000000004 | 1.132 | 0.491 | 0.213 |
| 1.296000000000004 | 1.145 | 0.494 | 0.213 |
| 1.300000000000004 | 1.158 | 0.497 | 0.214 |
| 1.304000000000004 | 1.171 | 0.5 | 0.214 |
| 1.308000000000004 | 1.184 | 0.503 | 0.214 |
| 1.312000000000004 | 1.197 | 0.506 | 0.214 |
| 1.316000000000004 | 1.21 | 0.509 | 0.214 |
| 1.320000000000004 | 1.223 | 0.512 | 0.214 |
| 1.324000000000004 | 1.236 | 0.514 | 0.214 |
| 1.328000000000004 | 1.249 | 0.517 | 0.214 |
| 1.332000000000004 | 1.262 | 0.52 | 0.214 |
| 1.336000000000004 | 1.275 | 0.522 | 0.214 |
| 1.340000000000004 | 1.288 | 0.525 | 0.214 |
| 1.344000000000004 | 1.301 | 0.527 | 0.214 |
| 1.348000000000004 | 1.314 | 0.53 | 0.214 |
| 1.352000000000004 | 1.327 | 0.532 | 0.213 |
| 1.356000000000004 | 1.34 | 0.535 | 0.213 |
| 1.360000000000004 | 1.354 | 0.537 | 0.213 |
| 1.364000000000004 | 1.367 | 0.539 | 0.213 |
| 1.368000000000004 | 1.38 | 0.541 | 0.212 |
| 1.372000000000004 | 1.393 | 0.544 | 0.212 |
| 1.376000000000004 | 1.406 | 0.546 | 0.212 |
| 1.380000000000004 | 1.419 | 0.548 | 0.211 |
| 1.384000000000004 | 1.432 | 0.55 | 0.211 |
| 1.388000000000005 | 1.446 | 0.552 | 0.211 |
| 1.392000000000004 | 1.459 | 0.554 | 0.21 |
| 1.396000000000004 | 1.472 | 0.555 | 0.21 |
| 1.400000000000005 | 1.485 | 0.557 | 0.209 |
| 1.404000000000005 | 1.498 | 0.559 | 0.209 |
| 1.408000000000005 | 1.511 | 0.561 | 0.208 |
| 1.412000000000005 | 1.524 | 0.562 | 0.208 |
| 1.416000000000005 | 1.537 | 0.564 | 0.207 |
| 1.420000000000005 | 1.55 | 0.566 | 0.206 |
| 1.424000000000005 | 1.563 | 0.567 | 0.206 |
| 1.428000000000005 | 1.576 | 0.568 | 0.205 |
| 1.432000000000005 | 1.589 | 0.57 | 0.204 |
| 1.436000000000005 | 1.601 | 0.571 | 0.204 |
| 1.440000000000005 | 1.614 | 0.572 | 0.203 |
| 1.444000000000005 | 1.627 | 0.574 | 0.202 |
| 1.448000000000005 | 1.64 | 0.575 | 0.201 |
| 1.452000000000005 | 1.653 | 0.576 | 0.201 |
| 1.456000000000005 | 1.665 | 0.577 | 0.2 |
| 1.460000000000005 | 1.678 | 0.578 | 0.199 |
| 1.464000000000005 | 1.69 | 0.579 | 0.198 |
| 1.468000000000005 | 1.703 | 0.58 | 0.197 |
| 1.472000000000005 | 1.715 | 0.581 | 0.196 |
| 1.476000000000005 | 1.728 | 0.581 | 0.196 |
| 1.480000000000005 | 1.74 | 0.582 | 0.195 |
| 1.484000000000005 | 1.752 | 0.583 | 0.194 |
| 1.488000000000005 | 1.765 | 0.583 | 0.193 |
| 1.492000000000005 | 1.777 | 0.584 | 0.192 |
| 1.496000000000005 | 1.789 | 0.584 | 0.191 |
| 1.500000000000005 | 1.801 | 0.585 | 0.19 |
| 1.504000000000005 | 1.813 | 0.585 | 0.189 |
| 1.508000000000005 | 1.825 | 0.585 | 0.188 |
| 1.512000000000005 | 1.837 | 0.586 | 0.187 |
| 1.516000000000005 | 1.848 | 0.586 | 0.186 |
| 1.520000000000005 | 1.86 | 0.586 | 0.185 |
| 1.524000000000005 | 1.872 | 0.586 | 0.183 |
| 1.528000000000005 | 1.883 | 0.586 | 0.182 |
| 1.532000000000005 | 1.895 | 0.586 | 0.181 |
| 1.536000000000005 | 1.906 | 0.586 | 0.18 |
| 1.540000000000005 | 1.917 | 0.586 | 0.179 |
| 1.544000000000005 | 1.928 | 0.586 | 0.178 |
| 1.548000000000005 | 1.94 | 0.585 | 0.177 |
| 1.552000000000005 | 1.951 | 0.585 | 0.175 |
| 1.556000000000005 | 1.961 | 0.585 | 0.174 |
| 1.560000000000005 | 1.972 | 0.584 | 0.173 |
| 1.564000000000005 | 1.983 | 0.584 | 0.172 |
| 1.568000000000005 | 1.994 | 0.583 | 0.171 |
| 1.572000000000005 | 2.004 | 0.583 | 0.169 |
| 1.576000000000005 | 2.015 | 0.582 | 0.168 |
| 1.580000000000005 | 2.025 | 0.581 | 0.167 |
| 1.584000000000005 | 2.035 | 0.58 | 0.166 |
| 1.588000000000005 | 2.045 | 0.58 | 0.164 |
| 1.592000000000005 | 2.055 | 0.579 | 0.163 |
| 1.596000000000005 | 2.065 | 0.578 | 0.162 |
| 1.600000000000005 | 2.075 | 0.577 | 0.16 |
| 1.604000000000005 | 2.085 | 0.576 | 0.159 |
| 1.608000000000005 | 2.094 | 0.575 | 0.158 |
| 1.612000000000005 | 2.104 | 0.574 | 0.156 |
| 1.616000000000005 | 2.113 | 0.573 | 0.155 |
| 1.620000000000005 | 2.122 | 0.571 | 0.154 |
| 1.624000000000005 | 2.132 | 0.57 | 0.153 |
| 1.628000000000005 | 2.141 | 0.569 | 0.151 |
| 1.632000000000005 | 2.149 | 0.568 | 0.15 |
| 1.636000000000005 | 2.158 | 0.566 | 0.148 |
| 1.640000000000005 | 2.167 | 0.565 | 0.147 |
| 1.644000000000005 | 2.175 | 0.563 | 0.146 |
| 1.648000000000005 | 2.184 | 0.562 | 0.144 |
| 1.652000000000005 | 2.192 | 0.56 | 0.143 |
| 1.656000000000005 | 2.2 | 0.558 | 0.142 |
| 1.660000000000005 | 2.208 | 0.557 | 0.14 |
| 1.664000000000005 | 2.216 | 0.555 | 0.139 |
| 1.668000000000005 | 2.224 | 0.553 | 0.138 |
| 1.672000000000005 | 2.231 | 0.551 | 0.136 |
| 1.676000000000005 | 2.239 | 0.55 | 0.135 |
| 1.680000000000005 | 2.246 | 0.548 | 0.134 |
| 1.684000000000005 | 2.253 | 0.546 | 0.132 |
| 1.688000000000005 | 2.26 | 0.544 | 0.131 |
| 1.692000000000005 | 2.267 | 0.542 | 0.129 |
| 1.696000000000005 | 2.274 | 0.54 | 0.128 |
| 1.700000000000005 | 2.281 | 0.538 | 0.127 |
| 1.704000000000005 | 2.287 | 0.535 | 0.125 |
| 1.708000000000005 | 2.293 | 0.533 | 0.124 |
| 1.712000000000005 | 2.3 | 0.531 | 0.123 |
| 1.716000000000005 | 2.306 | 0.529 | 0.121 |
| 1.720000000000005 | 2.311 | 0.527 | 0.12 |
| 1.724000000000005 | 2.317 | 0.524 | 0.119 |
| 1.728000000000005 | 2.323 | 0.522 | 0.117 |
| 1.732000000000005 | 2.328 | 0.52 | 0.116 |
| 1.736000000000005 | 2.334 | 0.517 | 0.115 |
| 1.740000000000005 | 2.339 | 0.515 | 0.113 |
| 1.744000000000005 | 2.344 | 0.512 | 0.112 |
| 1.748000000000005 | 2.349 | 0.51 | 0.111 |
| 1.752000000000005 | 2.353 | 0.507 | 0.109 |
| 1.756000000000005 | 2.358 | 0.505 | 0.108 |
| 1.760000000000005 | 2.362 | 0.502 | 0.107 |
| 1.764000000000005 | 2.366 | 0.499 | 0.105 |
| 1.768000000000005 | 2.371 | 0.497 | 0.104 |
| 1.772000000000005 | 2.374 | 0.494 | 0.103 |
| 1.776000000000005 | 2.378 | 0.491 | 0.101 |
| 1.780000000000005 | 2.382 | 0.489 | 0.1 |
| 1.784000000000005 | 2.385 | 0.486 | 0.099 |
| 1.788000000000005 | 2.389 | 0.483 | 0.098 |
| 1.792000000000005 | 2.392 | 0.48 | 0.096 |
| 1.796000000000005 | 2.395 | 0.477 | 0.095 |
| 1.800000000000005 | 2.398 | 0.475 | 0.094 |
| 1.804000000000005 | 2.4 | 0.472 | 0.093 |
| 1.808000000000005 | 2.403 | 0.469 | 0.091 |
| 1.812000000000005 | 2.405 | 0.466 | 0.09 |
| 1.816000000000005 | 2.408 | 0.463 | 0.089 |
| 1.820000000000005 | 2.41 | 0.46 | 0.088 |
| 1.824000000000005 | 2.411 | 0.457 | 0.087 |
| 1.828000000000005 | 2.413 | 0.454 | 0.085 |
| 1.832000000000005 | 2.415 | 0.451 | 0.084 |
| 1.836000000000005 | 2.416 | 0.448 | 0.083 |
| 1.840000000000005 | 2.418 | 0.445 | 0.082 |
| 1.844000000000005 | 2.419 | 0.442 | 0.081 |
| 1.848000000000005 | 2.42 | 0.439 | 0.08 |
| 1.852000000000005 | 2.42 | 0.436 | 0.078 |
| 1.856000000000005 | 2.421 | 0.433 | 0.077 |
| 1.860000000000005 | 2.422 | 0.429 | 0.076 |
| 1.864000000000005 | 2.422 | 0.426 | 0.075 |
| 1.868000000000005 | 2.422 | 0.423 | 0.074 |
| 1.872000000000005 | 2.422 | 0.42 | 0.073 |
| 1.876000000000005 | 2.422 | 0.417 | 0.072 |
| 1.880000000000005 | 2.422 | 0.414 | 0.071 |
| 1.884000000000005 | 2.421 | 0.41 | 0.07 |
| 1.888000000000005 | 2.421 | 0.407 | 0.069 |
| 1.892000000000005 | 2.42 | 0.404 | 0.067 |
| 1.896000000000005 | 2.419 | 0.401 | 0.066 |
| 1.900000000000005 | 2.418 | 0.398 | 0.065 |
| 1.904000000000005 | 2.417 | 0.395 | 0.064 |
| 1.908000000000005 | 2.416 | 0.391 | 0.063 |
| 1.912000000000005 | 2.414 | 0.388 | 0.062 |
| 1.916000000000005 | 2.412 | 0.385 | 0.061 |
| 1.920000000000005 | 2.411 | 0.382 | 0.06 |
| 1.924000000000005 | 2.409 | 0.378 | 0.059 |
| 1.928000000000005 | 2.407 | 0.375 | 0.058 |
| 1.932000000000005 | 2.404 | 0.372 | 0.058 |
| 1.936000000000005 | 2.402 | 0.369 | 0.057 |
| 1.940000000000005 | 2.399 | 0.365 | 0.056 |
| 1.944000000000005 | 2.397 | 0.362 | 0.055 |
| 1.948000000000005 | 2.394 | 0.359 | 0.054 |
| 1.952000000000005 | 2.391 | 0.356 | 0.053 |
| 1.956000000000005 | 2.388 | 0.353 | 0.052 |
| 1.960000000000005 | 2.385 | 0.349 | 0.051 |
| 1.964000000000005 | 2.381 | 0.346 | 0.05 |
| 1.968000000000005 | 2.378 | 0.343 | 0.049 |
| 1.972000000000005 | 2.374 | 0.34 | 0.049 |
| 1.976000000000005 | 2.37 | 0.336 | 0.048 |
| 1.980000000000005 | 2.366 | 0.333 | 0.047 |
| 1.984000000000005 | 2.362 | 0.33 | 0.046 |
| 1.988000000000005 | 2.358 | 0.327 | 0.045 |
| 1.992000000000005 | 2.354 | 0.324 | 0.045 |
| 1.996000000000005 | 2.349 | 0.32 | 0.044 |
| 2.000000000000005 | 2.344 | 0.317 | 0.043 |
| 2.004000000000005 | 2.34 | 0.314 | 0.042 |
| 2.008000000000005 | 2.335 | 0.311 | 0.041 |
| 2.012000000000005 | 2.33 | 0.308 | 0.041 |
| 2.016000000000005 | 2.325 | 0.305 | 0.04 |
| 2.020000000000005 | 2.319 | 0.302 | 0.039 |
| 2.024000000000005 | 2.314 | 0.298 | 0.038 |
| 2.028000000000005 | 2.308 | 0.295 | 0.038 |
| 2.032000000000005 | 2.303 | 0.292 | 0.037 |
| 2.036000000000005 | 2.297 | 0.289 | 0.036 |
| 2.040000000000005 | 2.291 | 0.286 | 0.036 |
| 2.044000000000005 | 2.285 | 0.283 | 0.035 |
| 2.048000000000005 | 2.279 | 0.28 | 0.034 |
| 2.052000000000005 | 2.273 | 0.277 | 0.034 |
| 2.056000000000005 | 2.266 | 0.274 | 0.033 |
| 2.060000000000005 | 2.26 | 0.271 | 0.032 |
| 2.064000000000005 | 2.253 | 0.268 | 0.032 |
| 2.068000000000005 | 2.247 | 0.265 | 0.031 |
| 2.072000000000005 | 2.24 | 0.262 | 0.031 |
| 2.076000000000005 | 2.233 | 0.259 | 0.03 |
| 2.080000000000005 | 2.226 | 0.256 | 0.029 |
| 2.084000000000005 | 2.219 | 0.253 | 0.029 |
| 2.088000000000005 | 2.212 | 0.25 | 0.028 |
| 2.092000000000005 | 2.204 | 0.247 | 0.028 |
| 2.096000000000005 | 2.197 | 0.244 | 0.027 |
| 2.100000000000005 | 2.189 | 0.241 | 0.027 |
| 2.104000000000005 | 2.182 | 0.239 | 0.026 |
| 2.108000000000005 | 2.174 | 0.236 | 0.026 |
| 2.112000000000005 | 2.166 | 0.233 | 0.025 |
| 2.116000000000005 | 2.158 | 0.23 | 0.025 |
| 2.120000000000005 | 2.15 | 0.227 | 0.024 |
| 2.124000000000005 | 2.142 | 0.224 | 0.024 |
| 2.128000000000005 | 2.134 | 0.222 | 0.023 |
| 2.132000000000005 | 2.125 | 0.219 | 0.023 |
| 2.136000000000005 | 2.117 | 0.216 | 0.022 |
| 2.140000000000005 | 2.109 | 0.214 | 0.022 |
| 2.144000000000005 | 2.1 | 0.211 | 0.021 |
| 2.148000000000005 | 2.091 | 0.208 | 0.021 |
| 2.152000000000005 | 2.083 | 0.206 | 0.02 |
| 2.156000000000005 | 2.074 | 0.203 | 0.02 |
| 2.160000000000005 | 2.065 | 0.2 | 0.019 |
| 2.164000000000005 | 2.056 | 0.198 | 0.019 |
| 2.168000000000005 | 2.047 | 0.195 | 0.019 |
| 2.172000000000005 | 2.038 | 0.193 | 0.018 |
| 2.176000000000005 | 2.029 | 0.19 | 0.018 |
| 2.180000000000005 | 2.02 | 0.188 | 0.017 |
| 2.184000000000005 | 2.01 | 0.185 | 0.017 |
| 2.188000000000005 | 2.001 | 0.183 | 0.017 |
| 2.192000000000005 | 1.991 | 0.18 | 0.016 |
| 2.196000000000005 | 1.982 | 0.178 | 0.016 |
| 2.200000000000005 | 1.972 | 0.175 | 0.016 |
| 2.204000000000005 | 1.963 | 0.173 | 0.015 |
| 2.208000000000005 | 1.953 | 0.171 | 0.015 |
| 2.212000000000005 | 1.943 | 0.168 | 0.015 |
| 2.216000000000005 | 1.933 | 0.166 | 0.014 |
| 2.220000000000005 | 1.924 | 0.164 | 0.014 |
| 2.224000000000005 | 1.914 | 0.161 | 0.014 |
| 2.228000000000005 | 1.904 | 0.159 | 0.013 |
| 2.232000000000005 | 1.894 | 0.157 | 0.013 |
| 2.236000000000005 | 1.883 | 0.155 | 0.013 |
| 2.240000000000005 | 1.873 | 0.152 | 0.012 |
| 2.244000000000005 | 1.863 | 0.15 | 0.012 |
| 2.248000000000005 | 1.853 | 0.148 | 0.012 |
| 2.252000000000005 | 1.843 | 0.146 | 0.012 |
| 2.256000000000005 | 1.832 | 0.144 | 0.011 |
| 2.260000000000005 | 1.822 | 0.142 | 0.011 |
| 2.264000000000005 | 1.812 | 0.14 | 0.011 |
| 2.268000000000005 | 1.801 | 0.138 | 0.011 |
| 2.272000000000005 | 1.791 | 0.136 | 0.01 |
| 2.276000000000005 | 1.78 | 0.134 | 0.01 |
| 2.280000000000005 | 1.77 | 0.132 | 0.01 |
| 2.284000000000005 | 1.759 | 0.13 | 0.01 |
| 2.288000000000005 | 1.749 | 0.128 | 0.009 |
| 2.292000000000005 | 1.738 | 0.126 | 0.009 |
| 2.296000000000005 | 1.727 | 0.124 | 0.009 |
| 2.300000000000005 | 1.717 | 0.122 | 0.009 |
| 2.304000000000005 | 1.706 | 0.12 | 0.008 |
| 2.308000000000005 | 1.695 | 0.118 | 0.008 |
| 2.312000000000005 | 1.684 | 0.116 | 0.008 |
| 2.316000000000005 | 1.674 | 0.115 | 0.008 |
| 2.320000000000005 | 1.663 | 0.113 | 0.008 |
| 2.324000000000005 | 1.652 | 0.111 | 0.007 |
| 2.328000000000005 | 1.641 | 0.109 | 0.007 |
| 2.332000000000005 | 1.63 | 0.108 | 0.007 |
| 2.336000000000005 | 1.62 | 0.106 | 0.007 |
| 2.340000000000005 | 1.609 | 0.104 | 0.007 |
| 2.344000000000005 | 1.598 | 0.102 | 0.007 |
| 2.348000000000005 | 1.587 | 0.101 | 0.006 |
| 2.352000000000005 | 1.576 | 0.099 | 0.006 |
| 2.356000000000005 | 1.565 | 0.098 | 0.006 |
| 2.360000000000005 | 1.554 | 0.096 | 0.006 |
| 2.364000000000005 | 1.543 | 0.094 | 0.006 |
| 2.368000000000005 | 1.532 | 0.093 | 0.006 |
| 2.372000000000005 | 1.522 | 0.091 | 0.005 |
| 2.376000000000005 | 1.511 | 0.09 | 0.005 |
| 2.380000000000005 | 1.5 | 0.088 | 0.005 |
| 2.384000000000005 | 1.489 | 0.087 | 0.005 |
| 2.388000000000005 | 1.478 | 0.085 | 0.005 |
| 2.392000000000005 | 1.467 | 0.084 | 0.005 |
| 2.396000000000005 | 1.456 | 0.083 | 0.005 |
| 2.400000000000005 | 1.445 | 0.081 | 0.005 |
| 2.404000000000005 | 1.434 | 0.08 | 0.004 |
| 2.408000000000005 | 1.423 | 0.078 | 0.004 |
| 2.412000000000005 | 1.413 | 0.077 | 0.004 |
| 2.416000000000005 | 1.402 | 0.076 | 0.004 |
| 2.420000000000005 | 1.391 | 0.074 | 0.004 |
| 2.424000000000005 | 1.38 | 0.073 | 0.004 |
| 2.428000000000005 | 1.369 | 0.072 | 0.004 |
| 2.432000000000005 | 1.358 | 0.071 | 0.004 |
| 2.436000000000005 | 1.348 | 0.069 | 0.004 |
| 2.440000000000005 | 1.337 | 0.068 | 0.003 |
| 2.444000000000005 | 1.326 | 0.067 | 0.003 |
| 2.448000000000005 | 1.315 | 0.066 | 0.003 |
| 2.452000000000005 | 1.305 | 0.065 | 0.003 |
| 2.456000000000005 | 1.294 | 0.063 | 0.003 |
| 2.460000000000005 | 1.283 | 0.062 | 0.003 |
| 2.464000000000005 | 1.273 | 0.061 | 0.003 |
| 2.468000000000005 | 1.262 | 0.06 | 0.003 |
| 2.472000000000005 | 1.252 | 0.059 | 0.003 |
| 2.476000000000005 | 1.241 | 0.058 | 0.003 |
| 2.480000000000005 | 1.23 | 0.057 | 0.003 |
| 2.484000000000005 | 1.22 | 0.056 | 0.003 |
| 2.488000000000005 | 1.21 | 0.055 | 0.002 |
| 2.492000000000005 | 1.199 | 0.054 | 0.002 |
| 2.496000000000005 | 1.189 | 0.053 | 0.002 |
| 2.500000000000005 | 1.178 | 0.052 | 0.002 |
| 2.504000000000005 | 1.168 | 0.051 | 0.002 |
| 2.508000000000005 | 1.158 | 0.05 | 0.002 |
| 2.512000000000005 | 1.147 | 0.049 | 0.002 |
| 2.516000000000005 | 1.137 | 0.048 | 0.002 |
| 2.520000000000005 | 1.127 | 0.047 | 0.002 |
| 2.524000000000005 | 1.117 | 0.046 | 0.002 |
| 2.528000000000005 | 1.107 | 0.045 | 0.002 |
| 2.532000000000005 | 1.096 | 0.044 | 0.002 |
| 2.536000000000005 | 1.086 | 0.044 | 0.002 |
| 2.540000000000005 | 1.076 | 0.043 | 0.002 |
| 2.544000000000005 | 1.066 | 0.042 | 0.002 |
| 2.548000000000005 | 1.056 | 0.041 | 0.002 |
| 2.552000000000005 | 1.046 | 0.04 | 0.002 |
| 2.556000000000005 | 1.037 | 0.04 | 0.002 |
| 2.560000000000005 | 1.027 | 0.039 | 0.001 |
| 2.564000000000005 | 1.017 | 0.038 | 0.001 |
| 2.568000000000005 | 1.007 | 0.037 | 0.001 |
| 2.572000000000005 | 0.998 | 0.037 | 0.001 |
| 2.576000000000005 | 0.988 | 0.036 | 0.001 |
| 2.580000000000005 | 0.978 | 0.035 | 0.001 |
| 2.584000000000005 | 0.969 | 0.034 | 0.001 |
| 2.588000000000005 | 0.959 | 0.034 | 0.001 |
| 2.592000000000005 | 0.95 | 0.033 | 0.001 |
| 2.596000000000005 | 0.94 | 0.032 | 0.001 |
| 2.600000000000005 | 0.931 | 0.032 | 0.001 |
| 2.604000000000005 | 0.922 | 0.031 | 0.001 |
| 2.608000000000005 | 0.912 | 0.03 | 0.001 |
| 2.612000000000005 | 0.903 | 0.03 | 0.001 |
| 2.616000000000005 | 0.894 | 0.029 | 0.001 |
| 2.620000000000005 | 0.885 | 0.029 | 0.001 |
| 2.624000000000005 | 0.876 | 0.028 | 0.001 |
| 2.628000000000005 | 0.867 | 0.027 | 0.001 |
| 2.632000000000005 | 0.858 | 0.027 | 0.001 |
| 2.636000000000005 | 0.849 | 0.026 | 0.001 |
| 2.640000000000005 | 0.84 | 0.026 | 0.001 |
| 2.644000000000005 | 0.831 | 0.025 | 0.001 |
| 2.648000000000005 | 0.823 | 0.025 | 0.001 |
| 2.652000000000005 | 0.814 | 0.024 | 0.001 |
| 2.656000000000005 | 0.805 | 0.024 | 0.001 |
| 2.660000000000005 | 0.797 | 0.023 | 0.001 |
| 2.664000000000005 | 0.788 | 0.023 | 0.001 |
| 2.668000000000005 | 0.78 | 0.022 | 0.001 |
| 2.672000000000005 | 0.771 | 0.022 | 0.001 |
| 2.676000000000005 | 0.763 | 0.021 | 0.001 |
| 2.680000000000005 | 0.755 | 0.021 | 0.001 |
| 2.684000000000005 | 0.746 | 0.02 | 0.001 |
| 2.688000000000005 | 0.738 | 0.02 | 0.001 |
| 2.692000000000005 | 0.73 | 0.019 | 0.001 |
| 2.696000000000005 | 0.722 | 0.019 | 0.001 |
| 2.700000000000005 | 0.714 | 0.019 | 0 |
| 2.704000000000005 | 0.706 | 0.018 | 0 |
| 2.708000000000005 | 0.698 | 0.018 | 0 |
| 2.712000000000005 | 0.69 | 0.017 | 0 |
| 2.716000000000005 | 0.682 | 0.017 | 0 |
| 2.720000000000005 | 0.674 | 0.017 | 0 |
| 2.724000000000005 | 0.667 | 0.016 | 0 |
| 2.728000000000005 | 0.659 | 0.016 | 0 |
| 2.732000000000005 | 0.651 | 0.016 | 0 |
| 2.736000000000005 | 0.644 | 0.015 | 0 |
| 2.740000000000005 | 0.636 | 0.015 | 0 |
| 2.744000000000005 | 0.629 | 0.015 | 0 |
| 2.748000000000005 | 0.622 | 0.014 | 0 |
| 2.752000000000005 | 0.614 | 0.014 | 0 |
| 2.756000000000005 | 0.607 | 0.014 | 0 |
| 2.760000000000005 | 0.6 | 0.013 | 0 |
| 2.764000000000005 | 0.593 | 0.013 | 0 |
| 2.768000000000005 | 0.586 | 0.013 | 0 |
| 2.772000000000005 | 0.579 | 0.012 | 0 |
| 2.776000000000005 | 0.572 | 0.012 | 0 |
| 2.780000000000005 | 0.565 | 0.012 | 0 |
| 2.784000000000005 | 0.558 | 0.012 | 0 |
| 2.788000000000006 | 0.551 | 0.011 | 0 |
| 2.792000000000005 | 0.544 | 0.011 | 0 |
| 2.796000000000005 | 0.538 | 0.011 | 0 |
| 2.800000000000006 | 0.531 | 0.011 | 0 |
| 2.804000000000006 | 0.525 | 0.01 | 0 |
| 2.808000000000006 | 0.518 | 0.01 | 0 |
| 2.812000000000006 | 0.512 | 0.01 | 0 |
| 2.816000000000006 | 0.505 | 0.01 | 0 |
| 2.820000000000006 | 0.499 | 0.009 | 0 |
| 2.824000000000006 | 0.493 | 0.009 | 0 |
| 2.828000000000006 | 0.486 | 0.009 | 0 |
| 2.832000000000006 | 0.48 | 0.009 | 0 |
| 2.836000000000006 | 0.474 | 0.009 | 0 |
| 2.840000000000006 | 0.468 | 0.008 | 0 |
| 2.844000000000006 | 0.462 | 0.008 | 0 |
| 2.848000000000006 | 0.456 | 0.008 | 0 |
| 2.852000000000006 | 0.45 | 0.008 | 0 |
| 2.856000000000006 | 0.445 | 0.008 | 0 |
| 2.860000000000006 | 0.439 | 0.007 | 0 |
| 2.864000000000006 | 0.433 | 0.007 | 0 |
| 2.868000000000006 | 0.427 | 0.007 | 0 |
| 2.872000000000006 | 0.422 | 0.007 | 0 |
| 2.876000000000006 | 0.416 | 0.007 | 0 |
| 2.880000000000006 | 0.411 | 0.006 | 0 |
| 2.884000000000006 | 0.405 | 0.006 | 0 |
| 2.888000000000006 | 0.4 | 0.006 | 0 |
| 2.892000000000006 | 0.395 | 0.006 | 0 |
| 2.896000000000006 | 0.389 | 0.006 | 0 |
| 2.900000000000006 | 0.384 | 0.006 | 0 |
| 2.904000000000006 | 0.379 | 0.006 | 0 |
| 2.908000000000006 | 0.374 | 0.005 | 0 |
| 2.912000000000006 | 0.369 | 0.005 | 0 |
| 2.916000000000006 | 0.364 | 0.005 | 0 |
| 2.920000000000006 | 0.359 | 0.005 | 0 |
| 2.924000000000006 | 0.354 | 0.005 | 0 |
| 2.928000000000006 | 0.349 | 0.005 | 0 |
| 2.932000000000006 | 0.344 | 0.005 | 0 |
| 2.936000000000006 | 0.339 | 0.005 | 0 |
| 2.940000000000006 | 0.335 | 0.004 | 0 |
| 2.944000000000006 | 0.33 | 0.004 | 0 |
| 2.948000000000006 | 0.325 | 0.004 | 0 |
| 2.952000000000006 | 0.321 | 0.004 | 0 |
| 2.956000000000006 | 0.316 | 0.004 | 0 |
| 2.960000000000006 | 0.312 | 0.004 | 0 |
| 2.964000000000006 | 0.307 | 0.004 | 0 |
| 2.968000000000006 | 0.303 | 0.004 | 0 |
| 2.972000000000006 | 0.299 | 0.004 | 0 |
| 2.976000000000006 | 0.294 | 0.004 | 0 |
| 2.980000000000006 | 0.29 | 0.003 | 0 |
| 2.984000000000006 | 0.286 | 0.003 | 0 |
| 2.988000000000006 | 0.282 | 0.003 | 0 |
| 2.992000000000006 | 0.278 | 0.003 | 0 |
| 2.996000000000006 | 0.274 | 0.003 | 0 |
| 3.000000000000006 | 0.27 | 0.003 | 0 |
| 3.004000000000006 | 0.266 | 0.003 | 0 |
| 3.008000000000006 | 0.262 | 0.003 | 0 |
| 3.012000000000006 | 0.258 | 0.003 | 0 |
| 3.016000000000006 | 0.254 | 0.003 | 0 |
| 3.020000000000006 | 0.251 | 0.003 | 0 |
| 3.024000000000006 | 0.247 | 0.003 | 0 |
| 3.028000000000006 | 0.243 | 0.002 | 0 |
| 3.032000000000006 | 0.24 | 0.002 | 0 |
| 3.036000000000006 | 0.236 | 0.002 | 0 |
| 3.040000000000006 | 0.233 | 0.002 | 0 |
| 3.044000000000006 | 0.229 | 0.002 | 0 |
| 3.048000000000006 | 0.226 | 0.002 | 0 |
| 3.052000000000006 | 0.222 | 0.002 | 0 |
| 3.056000000000006 | 0.219 | 0.002 | 0 |
| 3.060000000000006 | 0.216 | 0.002 | 0 |
| 3.064000000000006 | 0.212 | 0.002 | 0 |
| 3.068000000000006 | 0.209 | 0.002 | 0 |
| 3.072000000000006 | 0.206 | 0.002 | 0 |
| 3.076000000000006 | 0.203 | 0.002 | 0 |
| 3.080000000000006 | 0.2 | 0.002 | 0 |
| 3.084000000000006 | 0.196 | 0.002 | 0 |
| 3.088000000000006 | 0.193 | 0.002 | 0 |
| 3.092000000000006 | 0.19 | 0.002 | 0 |
| 3.096000000000006 | 0.187 | 0.002 | 0 |
| 3.100000000000006 | 0.184 | 0.002 | 0 |
| 3.104000000000006 | 0.182 | 0.001 | 0 |
| 3.108000000000006 | 0.179 | 0.001 | 0 |
| 3.112000000000006 | 0.176 | 0.001 | 0 |
| 3.116000000000006 | 0.173 | 0.001 | 0 |
| 3.120000000000006 | 0.17 | 0.001 | 0 |
| 3.124000000000006 | 0.168 | 0.001 | 0 |
| 3.128000000000006 | 0.165 | 0.001 | 0 |
| 3.132000000000006 | 0.162 | 0.001 | 0 |
| 3.136000000000006 | 0.16 | 0.001 | 0 |
| 3.140000000000006 | 0.157 | 0.001 | 0 |
| 3.144000000000006 | 0.155 | 0.001 | 0 |
| 3.148000000000006 | 0.152 | 0.001 | 0 |
| 3.152000000000006 | 0.15 | 0.001 | 0 |
| 3.156000000000006 | 0.147 | 0.001 | 0 |
| 3.160000000000006 | 0.145 | 0.001 | 0 |
| 3.164000000000006 | 0.143 | 0.001 | 0 |
| 3.168000000000006 | 0.14 | 0.001 | 0 |
| 3.172000000000006 | 0.138 | 0.001 | 0 |
| 3.176000000000006 | 0.136 | 0.001 | 0 |
| 3.180000000000006 | 0.133 | 0.001 | 0 |
| 3.184000000000006 | 0.131 | 0.001 | 0 |
| 3.188000000000006 | 0.129 | 0.001 | 0 |
| 3.192000000000006 | 0.127 | 0.001 | 0 |
| 3.196000000000006 | 0.125 | 0.001 | 0 |
| 3.200000000000006 | 0.123 | 0.001 | 0 |
| 3.204000000000006 | 0.121 | 0.001 | 0 |
| 3.208000000000006 | 0.119 | 0.001 | 0 |
| 3.212000000000006 | 0.117 | 0.001 | 0 |
| 3.216000000000006 | 0.115 | 0.001 | 0 |
| 3.220000000000006 | 0.113 | 0.001 | 0 |
| 3.224000000000006 | 0.111 | 0.001 | 0 |
| 3.228000000000006 | 0.109 | 0.001 | 0 |
| 3.232000000000006 | 0.107 | 0.001 | 0 |
| 3.236000000000006 | 0.105 | 0.001 | 0 |
| 3.240000000000006 | 0.103 | 0.001 | 0 |
| 3.244000000000006 | 0.102 | 0.001 | 0 |
| 3.248000000000006 | 0.1 | 0.001 | 0 |
| 3.252000000000006 | 0.098 | 0 | 0 |
| 3.256000000000006 | 0.097 | 0 | 0 |
| 3.260000000000006 | 0.095 | 0 | 0 |
| 3.264000000000006 | 0.093 | 0 | 0 |
| 3.268000000000006 | 0.092 | 0 | 0 |
| 3.272000000000006 | 0.09 | 0 | 0 |
| 3.276000000000006 | 0.088 | 0 | 0 |
| 3.280000000000006 | 0.087 | 0 | 0 |
| 3.284000000000006 | 0.085 | 0 | 0 |
| 3.288000000000006 | 0.084 | 0 | 0 |
| 3.292000000000006 | 0.082 | 0 | 0 |
| 3.296000000000006 | 0.081 | 0 | 0 |
| 3.300000000000006 | 0.079 | 0 | 0 |
| 3.304000000000006 | 0.078 | 0 | 0 |
| 3.308000000000006 | 0.077 | 0 | 0 |
| 3.312000000000006 | 0.075 | 0 | 0 |
| 3.316000000000006 | 0.074 | 0 | 0 |
| 3.320000000000006 | 0.073 | 0 | 0 |
| 3.324000000000006 | 0.071 | 0 | 0 |
| 3.328000000000006 | 0.07 | 0 | 0 |
| 3.332000000000006 | 0.069 | 0 | 0 |
| 3.336000000000006 | 0.068 | 0 | 0 |
| 3.340000000000006 | 0.066 | 0 | 0 |
| 3.344000000000006 | 0.065 | 0 | 0 |
| 3.348000000000006 | 0.064 | 0 | 0 |
| 3.352000000000006 | 0.063 | 0 | 0 |
| 3.356000000000006 | 0.062 | 0 | 0 |
| 3.360000000000006 | 0.06 | 0 | 0 |
| 3.364000000000006 | 0.059 | 0 | 0 |
| 3.368000000000006 | 0.058 | 0 | 0 |
| 3.372000000000006 | 0.057 | 0 | 0 |
| 3.376000000000006 | 0.056 | 0 | 0 |
| 3.380000000000006 | 0.055 | 0 | 0 |
| 3.384000000000006 | 0.054 | 0 | 0 |
| 3.388000000000006 | 0.053 | 0 | 0 |
| 3.392000000000006 | 0.052 | 0 | 0 |
| 3.396000000000006 | 0.051 | 0 | 0 |
| 3.400000000000006 | 0.05 | 0 | 0 |
| 3.404000000000006 | 0.049 | 0 | 0 |
| 3.408000000000006 | 0.048 | 0 | 0 |
| 3.412000000000006 | 0.047 | 0 | 0 |
| 3.416000000000006 | 0.046 | 0 | 0 |
| 3.420000000000006 | 0.046 | 0 | 0 |
| 3.424000000000006 | 0.045 | 0 | 0 |
| 3.428000000000006 | 0.044 | 0 | 0 |
| 3.432000000000006 | 0.043 | 0 | 0 |
| 3.436000000000006 | 0.042 | 0 | 0 |
| 3.440000000000006 | 0.041 | 0 | 0 |
| 3.444000000000006 | 0.041 | 0 | 0 |
| 3.448000000000006 | 0.04 | 0 | 0 |
| 3.452000000000006 | 0.039 | 0 | 0 |
| 3.456000000000006 | 0.038 | 0 | 0 |
| 3.460000000000006 | 0.038 | 0 | 0 |
| 3.464000000000006 | 0.037 | 0 | 0 |
| 3.468000000000006 | 0.036 | 0 | 0 |
| 3.472000000000006 | 0.035 | 0 | 0 |
| 3.476000000000006 | 0.035 | 0 | 0 |
| 3.480000000000006 | 0.034 | 0 | 0 |
| 3.484000000000006 | 0.033 | 0 | 0 |
| 3.488000000000006 | 0.033 | 0 | 0 |
| 3.492000000000006 | 0.032 | 0 | 0 |
| 3.496000000000006 | 0.031 | 0 | 0 |
| 3.500000000000006 | 0.031 | 0 | 0 |
| 3.504000000000006 | 0.03 | 0 | 0 |
| 3.508000000000006 | 0.03 | 0 | 0 |
| 3.512000000000006 | 0.029 | 0 | 0 |
| 3.516000000000006 | 0.028 | 0 | 0 |
| 3.520000000000006 | 0.028 | 0 | 0 |
| 3.524000000000006 | 0.027 | 0 | 0 |
| 3.528000000000006 | 0.027 | 0 | 0 |
| 3.532000000000006 | 0.026 | 0 | 0 |
| 3.536000000000006 | 0.026 | 0 | 0 |
| 3.540000000000006 | 0.025 | 0 | 0 |
| 3.544000000000006 | 0.025 | 0 | 0 |
| 3.548000000000006 | 0.024 | 0 | 0 |
| 3.552000000000006 | 0.024 | 0 | 0 |
| 3.556000000000006 | 0.023 | 0 | 0 |
| 3.560000000000006 | 0.023 | 0 | 0 |
| 3.564000000000006 | 0.022 | 0 | 0 |
| 3.568000000000006 | 0.022 | 0 | 0 |
| 3.572000000000006 | 0.021 | 0 | 0 |
| 3.576000000000006 | 0.021 | 0 | 0 |
| 3.580000000000006 | 0.02 | 0 | 0 |
| 3.584000000000006 | 0.02 | 0 | 0 |
| 3.588000000000006 | 0.02 | 0 | 0 |
| 3.592000000000006 | 0.019 | 0 | 0 |
| 3.596000000000006 | 0.019 | 0 | 0 |
| 3.600000000000006 | 0.018 | 0 | 0 |
| 3.604000000000006 | 0.018 | 0 | 0 |
| 3.608000000000006 | 0.018 | 0 | 0 |
| 3.612000000000006 | 0.017 | 0 | 0 |
| 3.616000000000006 | 0.017 | 0 | 0 |
| 3.620000000000006 | 0.017 | 0 | 0 |
| 3.624000000000006 | 0.016 | 0 | 0 |
| 3.628000000000006 | 0.016 | 0 | 0 |
| 3.632000000000006 | 0.016 | 0 | 0 |
| 3.636000000000006 | 0.015 | 0 | 0 |
| 3.640000000000006 | 0.015 | 0 | 0 |
| 3.644000000000006 | 0.015 | 0 | 0 |
| 3.648000000000006 | 0.014 | 0 | 0 |
| 3.652000000000006 | 0.014 | 0 | 0 |
| 3.656000000000006 | 0.014 | 0 | 0 |
| 3.660000000000006 | 0.013 | 0 | 0 |
| 3.664000000000006 | 0.013 | 0 | 0 |
| 3.668000000000006 | 0.013 | 0 | 0 |
| 3.672000000000006 | 0.013 | 0 | 0 |
| 3.676000000000006 | 0.012 | 0 | 0 |
| 3.680000000000006 | 0.012 | 0 | 0 |
| 3.684000000000006 | 0.012 | 0 | 0 |
| 3.688000000000006 | 0.011 | 0 | 0 |
| 3.692000000000006 | 0.011 | 0 | 0 |
| 3.696000000000006 | 0.011 | 0 | 0 |
| 3.700000000000006 | 0.011 | 0 | 0 |
| 3.704000000000006 | 0.011 | 0 | 0 |
| 3.708000000000006 | 0.01 | 0 | 0 |
| 3.712000000000006 | 0.01 | 0 | 0 |
| 3.716000000000006 | 0.01 | 0 | 0 |
| 3.720000000000006 | 0.01 | 0 | 0 |
| 3.724000000000006 | 0.009 | 0 | 0 |
| 3.728000000000006 | 0.009 | 0 | 0 |
| 3.732000000000006 | 0.009 | 0 | 0 |
| 3.736000000000006 | 0.009 | 0 | 0 |
| 3.740000000000006 | 0.009 | 0 | 0 |
| 3.744000000000006 | 0.008 | 0 | 0 |
| 3.748000000000006 | 0.008 | 0 | 0 |
| 3.752000000000006 | 0.008 | 0 | 0 |
| 3.756000000000006 | 0.008 | 0 | 0 |
| 3.760000000000006 | 0.008 | 0 | 0 |
| 3.764000000000006 | 0.008 | 0 | 0 |
| 3.768000000000006 | 0.007 | 0 | 0 |
| 3.772000000000006 | 0.007 | 0 | 0 |
| 3.776000000000006 | 0.007 | 0 | 0 |
| 3.780000000000006 | 0.007 | 0 | 0 |
| 3.784000000000006 | 0.007 | 0 | 0 |
| 3.788000000000006 | 0.007 | 0 | 0 |
| 3.792000000000006 | 0.006 | 0 | 0 |
| 3.796000000000006 | 0.006 | 0 | 0 |
| 3.800000000000006 | 0.006 | 0 | 0 |
| 3.804000000000006 | 0.006 | 0 | 0 |
| 3.808000000000006 | 0.006 | 0 | 0 |
| 3.812000000000006 | 0.006 | 0 | 0 |
| 3.816000000000006 | 0.006 | 0 | 0 |
| 3.820000000000006 | 0.005 | 0 | 0 |
| 3.824000000000006 | 0.005 | 0 | 0 |
| 3.828000000000006 | 0.005 | 0 | 0 |
| 3.832000000000006 | 0.005 | 0 | 0 |
| 3.836000000000006 | 0.005 | 0 | 0 |
| 3.840000000000006 | 0.005 | 0 | 0 |
| 3.844000000000006 | 0.005 | 0 | 0 |
| 3.848000000000006 | 0.005 | 0 | 0 |
| 3.852000000000006 | 0.005 | 0 | 0 |
| 3.856000000000006 | 0.004 | 0 | 0 |
| 3.860000000000006 | 0.004 | 0 | 0 |
| 3.864000000000006 | 0.004 | 0 | 0 |
| 3.868000000000006 | 0.004 | 0 | 0 |
| 3.872000000000006 | 0.004 | 0 | 0 |
| 3.876000000000006 | 0.004 | 0 | 0 |
| 3.880000000000006 | 0.004 | 0 | 0 |
| 3.884000000000006 | 0.004 | 0 | 0 |
| 3.888000000000007 | 0.004 | 0 | 0 |
| 3.892000000000006 | 0.004 | 0 | 0 |
| 3.896000000000006 | 0.003 | 0 | 0 |
| 3.900000000000007 | 0.003 | 0 | 0 |
| 3.904000000000007 | 0.003 | 0 | 0 |
| 3.908000000000007 | 0.003 | 0 | 0 |
| 3.912000000000007 | 0.003 | 0 | 0 |
| 3.916000000000007 | 0.003 | 0 | 0 |
| 3.920000000000007 | 0.003 | 0 | 0 |
| 3.924000000000007 | 0.003 | 0 | 0 |
| 3.928000000000007 | 0.003 | 0 | 0 |
| 3.932000000000007 | 0.003 | 0 | 0 |
| 3.936000000000007 | 0.003 | 0 | 0 |
| 3.940000000000007 | 0.003 | 0 | 0 |
| 3.944000000000007 | 0.003 | 0 | 0 |
| 3.948000000000007 | 0.003 | 0 | 0 |
| 3.952000000000007 | 0.002 | 0 | 0 |
| 3.956000000000007 | 0.002 | 0 | 0 |
| 3.960000000000007 | 0.002 | 0 | 0 |
| 3.964000000000007 | 0.002 | 0 | 0 |
| 3.968000000000007 | 0.002 | 0 | 0 |
| 3.972000000000007 | 0.002 | 0 | 0 |
| 3.976000000000007 | 0.002 | 0 | 0 |
| 3.980000000000007 | 0.002 | 0 | 0 |
| 3.984000000000007 | 0.002 | 0 | 0 |
| 3.988000000000007 | 0.002 | 0 | 0 |
| 3.992000000000007 | 0.002 | 0 | 0 |
| 3.996000000000007 | 0.002 | 0 | 0 |
| 4.000000000000006 | 0.002 | 0 | 0 |